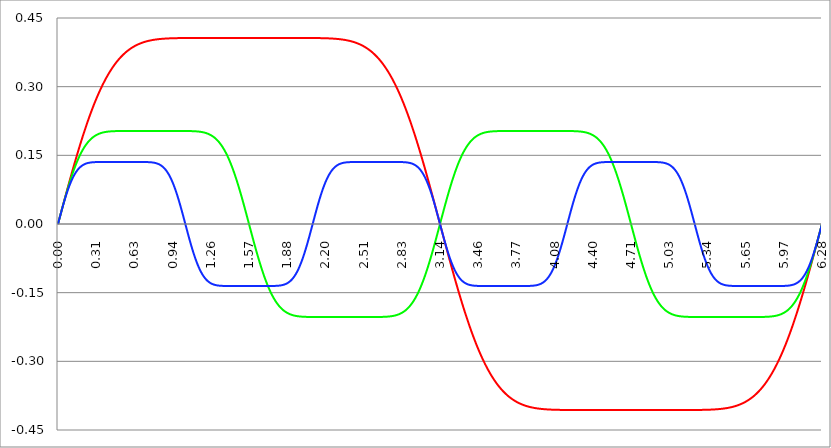
| Category | Series 1 | Series 0 | Series 2 |
|---|---|---|---|
| 0.0 | 0 | 0 | 0 |
| 0.00314159265358979 | 0.003 | 0.003 | 0.003 |
| 0.00628318530717958 | 0.006 | 0.006 | 0.006 |
| 0.00942477796076938 | 0.009 | 0.009 | 0.009 |
| 0.0125663706143592 | 0.013 | 0.013 | 0.013 |
| 0.015707963267949 | 0.016 | 0.016 | 0.016 |
| 0.0188495559215388 | 0.019 | 0.019 | 0.019 |
| 0.0219911485751285 | 0.022 | 0.022 | 0.022 |
| 0.0251327412287183 | 0.025 | 0.025 | 0.025 |
| 0.0282743338823081 | 0.028 | 0.028 | 0.028 |
| 0.0314159265358979 | 0.031 | 0.031 | 0.031 |
| 0.0345575191894877 | 0.034 | 0.034 | 0.034 |
| 0.0376991118430775 | 0.038 | 0.037 | 0.037 |
| 0.0408407044966673 | 0.041 | 0.04 | 0.04 |
| 0.0439822971502571 | 0.044 | 0.043 | 0.043 |
| 0.0471238898038469 | 0.047 | 0.047 | 0.046 |
| 0.0502654824574367 | 0.05 | 0.05 | 0.049 |
| 0.0534070751110265 | 0.053 | 0.053 | 0.051 |
| 0.0565486677646163 | 0.056 | 0.055 | 0.054 |
| 0.059690260418206 | 0.059 | 0.058 | 0.057 |
| 0.0628318530717958 | 0.062 | 0.061 | 0.06 |
| 0.0659734457253856 | 0.066 | 0.064 | 0.062 |
| 0.0691150383789754 | 0.069 | 0.067 | 0.065 |
| 0.0722566310325652 | 0.072 | 0.07 | 0.067 |
| 0.075398223686155 | 0.075 | 0.073 | 0.07 |
| 0.0785398163397448 | 0.078 | 0.076 | 0.072 |
| 0.0816814089933346 | 0.081 | 0.079 | 0.075 |
| 0.0848230016469244 | 0.084 | 0.081 | 0.077 |
| 0.0879645943005142 | 0.087 | 0.084 | 0.08 |
| 0.091106186954104 | 0.09 | 0.087 | 0.082 |
| 0.0942477796076937 | 0.093 | 0.089 | 0.084 |
| 0.0973893722612835 | 0.096 | 0.092 | 0.086 |
| 0.100530964914873 | 0.099 | 0.095 | 0.088 |
| 0.103672557568463 | 0.102 | 0.097 | 0.09 |
| 0.106814150222053 | 0.105 | 0.1 | 0.092 |
| 0.109955742875643 | 0.108 | 0.102 | 0.094 |
| 0.113097335529233 | 0.111 | 0.105 | 0.096 |
| 0.116238928182822 | 0.114 | 0.107 | 0.098 |
| 0.119380520836412 | 0.117 | 0.11 | 0.1 |
| 0.122522113490002 | 0.12 | 0.112 | 0.101 |
| 0.125663706143592 | 0.123 | 0.115 | 0.103 |
| 0.128805298797181 | 0.126 | 0.117 | 0.105 |
| 0.131946891450771 | 0.129 | 0.119 | 0.106 |
| 0.135088484104361 | 0.131 | 0.122 | 0.108 |
| 0.138230076757951 | 0.134 | 0.124 | 0.109 |
| 0.141371669411541 | 0.137 | 0.126 | 0.111 |
| 0.14451326206513 | 0.14 | 0.128 | 0.112 |
| 0.14765485471872 | 0.143 | 0.13 | 0.113 |
| 0.15079644737231 | 0.146 | 0.132 | 0.114 |
| 0.1539380400259 | 0.149 | 0.134 | 0.116 |
| 0.15707963267949 | 0.151 | 0.136 | 0.117 |
| 0.160221225333079 | 0.154 | 0.138 | 0.118 |
| 0.163362817986669 | 0.157 | 0.14 | 0.119 |
| 0.166504410640259 | 0.16 | 0.142 | 0.12 |
| 0.169646003293849 | 0.163 | 0.144 | 0.121 |
| 0.172787595947439 | 0.165 | 0.146 | 0.122 |
| 0.175929188601028 | 0.168 | 0.148 | 0.123 |
| 0.179070781254618 | 0.171 | 0.15 | 0.123 |
| 0.182212373908208 | 0.174 | 0.151 | 0.124 |
| 0.185353966561798 | 0.176 | 0.153 | 0.125 |
| 0.188495559215388 | 0.179 | 0.155 | 0.126 |
| 0.191637151868977 | 0.182 | 0.156 | 0.126 |
| 0.194778744522567 | 0.184 | 0.158 | 0.127 |
| 0.197920337176157 | 0.187 | 0.159 | 0.128 |
| 0.201061929829747 | 0.189 | 0.161 | 0.128 |
| 0.204203522483336 | 0.192 | 0.162 | 0.129 |
| 0.207345115136926 | 0.195 | 0.164 | 0.129 |
| 0.210486707790516 | 0.197 | 0.165 | 0.13 |
| 0.213628300444106 | 0.2 | 0.167 | 0.13 |
| 0.216769893097696 | 0.202 | 0.168 | 0.13 |
| 0.219911485751285 | 0.205 | 0.169 | 0.131 |
| 0.223053078404875 | 0.207 | 0.17 | 0.131 |
| 0.226194671058465 | 0.21 | 0.172 | 0.132 |
| 0.229336263712055 | 0.212 | 0.173 | 0.132 |
| 0.232477856365645 | 0.215 | 0.174 | 0.132 |
| 0.235619449019234 | 0.217 | 0.175 | 0.132 |
| 0.238761041672824 | 0.22 | 0.176 | 0.133 |
| 0.241902634326414 | 0.222 | 0.177 | 0.133 |
| 0.245044226980004 | 0.225 | 0.178 | 0.133 |
| 0.248185819633594 | 0.227 | 0.179 | 0.133 |
| 0.251327412287183 | 0.229 | 0.18 | 0.134 |
| 0.254469004940773 | 0.232 | 0.181 | 0.134 |
| 0.257610597594363 | 0.234 | 0.182 | 0.134 |
| 0.260752190247953 | 0.236 | 0.183 | 0.134 |
| 0.263893782901543 | 0.239 | 0.184 | 0.134 |
| 0.267035375555132 | 0.241 | 0.185 | 0.134 |
| 0.270176968208722 | 0.243 | 0.185 | 0.134 |
| 0.273318560862312 | 0.245 | 0.186 | 0.135 |
| 0.276460153515902 | 0.248 | 0.187 | 0.135 |
| 0.279601746169492 | 0.25 | 0.188 | 0.135 |
| 0.282743338823082 | 0.252 | 0.188 | 0.135 |
| 0.285884931476671 | 0.254 | 0.189 | 0.135 |
| 0.289026524130261 | 0.256 | 0.19 | 0.135 |
| 0.292168116783851 | 0.258 | 0.19 | 0.135 |
| 0.295309709437441 | 0.261 | 0.191 | 0.135 |
| 0.298451302091031 | 0.263 | 0.192 | 0.135 |
| 0.30159289474462 | 0.265 | 0.192 | 0.135 |
| 0.30473448739821 | 0.267 | 0.193 | 0.135 |
| 0.3078760800518 | 0.269 | 0.193 | 0.135 |
| 0.31101767270539 | 0.271 | 0.194 | 0.135 |
| 0.31415926535898 | 0.273 | 0.194 | 0.135 |
| 0.31730085801257 | 0.275 | 0.195 | 0.135 |
| 0.320442450666159 | 0.277 | 0.195 | 0.135 |
| 0.323584043319749 | 0.279 | 0.195 | 0.135 |
| 0.326725635973339 | 0.281 | 0.196 | 0.135 |
| 0.329867228626929 | 0.283 | 0.196 | 0.135 |
| 0.333008821280519 | 0.285 | 0.197 | 0.135 |
| 0.336150413934108 | 0.286 | 0.197 | 0.135 |
| 0.339292006587698 | 0.288 | 0.197 | 0.135 |
| 0.342433599241288 | 0.29 | 0.198 | 0.135 |
| 0.345575191894878 | 0.292 | 0.198 | 0.135 |
| 0.348716784548468 | 0.294 | 0.198 | 0.135 |
| 0.351858377202058 | 0.296 | 0.199 | 0.135 |
| 0.354999969855647 | 0.297 | 0.199 | 0.135 |
| 0.358141562509237 | 0.299 | 0.199 | 0.135 |
| 0.361283155162827 | 0.301 | 0.199 | 0.135 |
| 0.364424747816417 | 0.303 | 0.2 | 0.135 |
| 0.367566340470007 | 0.304 | 0.2 | 0.135 |
| 0.370707933123597 | 0.306 | 0.2 | 0.135 |
| 0.373849525777186 | 0.308 | 0.2 | 0.135 |
| 0.376991118430776 | 0.309 | 0.2 | 0.135 |
| 0.380132711084366 | 0.311 | 0.2 | 0.135 |
| 0.383274303737956 | 0.312 | 0.201 | 0.135 |
| 0.386415896391546 | 0.314 | 0.201 | 0.135 |
| 0.389557489045135 | 0.316 | 0.201 | 0.135 |
| 0.392699081698725 | 0.317 | 0.201 | 0.135 |
| 0.395840674352315 | 0.319 | 0.201 | 0.135 |
| 0.398982267005905 | 0.32 | 0.201 | 0.135 |
| 0.402123859659495 | 0.322 | 0.202 | 0.135 |
| 0.405265452313085 | 0.323 | 0.202 | 0.135 |
| 0.408407044966674 | 0.325 | 0.202 | 0.135 |
| 0.411548637620264 | 0.326 | 0.202 | 0.135 |
| 0.414690230273854 | 0.327 | 0.202 | 0.135 |
| 0.417831822927444 | 0.329 | 0.202 | 0.135 |
| 0.420973415581034 | 0.33 | 0.202 | 0.135 |
| 0.424115008234623 | 0.332 | 0.202 | 0.135 |
| 0.427256600888213 | 0.333 | 0.202 | 0.135 |
| 0.430398193541803 | 0.334 | 0.202 | 0.135 |
| 0.433539786195393 | 0.336 | 0.202 | 0.135 |
| 0.436681378848983 | 0.337 | 0.202 | 0.135 |
| 0.439822971502573 | 0.338 | 0.202 | 0.135 |
| 0.442964564156162 | 0.34 | 0.203 | 0.135 |
| 0.446106156809752 | 0.341 | 0.203 | 0.135 |
| 0.449247749463342 | 0.342 | 0.203 | 0.135 |
| 0.452389342116932 | 0.343 | 0.203 | 0.135 |
| 0.455530934770522 | 0.344 | 0.203 | 0.135 |
| 0.458672527424111 | 0.346 | 0.203 | 0.135 |
| 0.461814120077701 | 0.347 | 0.203 | 0.135 |
| 0.464955712731291 | 0.348 | 0.203 | 0.135 |
| 0.468097305384881 | 0.349 | 0.203 | 0.135 |
| 0.471238898038471 | 0.35 | 0.203 | 0.135 |
| 0.474380490692061 | 0.351 | 0.203 | 0.135 |
| 0.47752208334565 | 0.352 | 0.203 | 0.135 |
| 0.48066367599924 | 0.353 | 0.203 | 0.135 |
| 0.48380526865283 | 0.355 | 0.203 | 0.135 |
| 0.48694686130642 | 0.356 | 0.203 | 0.135 |
| 0.49008845396001 | 0.357 | 0.203 | 0.135 |
| 0.493230046613599 | 0.358 | 0.203 | 0.135 |
| 0.496371639267189 | 0.359 | 0.203 | 0.135 |
| 0.499513231920779 | 0.36 | 0.203 | 0.135 |
| 0.502654824574369 | 0.361 | 0.203 | 0.135 |
| 0.505796417227959 | 0.361 | 0.203 | 0.135 |
| 0.508938009881549 | 0.362 | 0.203 | 0.135 |
| 0.512079602535138 | 0.363 | 0.203 | 0.135 |
| 0.515221195188728 | 0.364 | 0.203 | 0.135 |
| 0.518362787842318 | 0.365 | 0.203 | 0.135 |
| 0.521504380495908 | 0.366 | 0.203 | 0.135 |
| 0.524645973149498 | 0.367 | 0.203 | 0.135 |
| 0.527787565803087 | 0.368 | 0.203 | 0.135 |
| 0.530929158456677 | 0.369 | 0.203 | 0.135 |
| 0.534070751110267 | 0.369 | 0.203 | 0.135 |
| 0.537212343763857 | 0.37 | 0.203 | 0.135 |
| 0.540353936417447 | 0.371 | 0.203 | 0.135 |
| 0.543495529071037 | 0.372 | 0.203 | 0.135 |
| 0.546637121724626 | 0.373 | 0.203 | 0.135 |
| 0.549778714378216 | 0.373 | 0.203 | 0.135 |
| 0.552920307031806 | 0.374 | 0.203 | 0.135 |
| 0.556061899685396 | 0.375 | 0.203 | 0.135 |
| 0.559203492338986 | 0.375 | 0.203 | 0.135 |
| 0.562345084992576 | 0.376 | 0.203 | 0.135 |
| 0.565486677646165 | 0.377 | 0.203 | 0.135 |
| 0.568628270299755 | 0.378 | 0.203 | 0.135 |
| 0.571769862953345 | 0.378 | 0.203 | 0.135 |
| 0.574911455606935 | 0.379 | 0.203 | 0.135 |
| 0.578053048260525 | 0.38 | 0.203 | 0.135 |
| 0.581194640914114 | 0.38 | 0.203 | 0.135 |
| 0.584336233567704 | 0.381 | 0.203 | 0.135 |
| 0.587477826221294 | 0.381 | 0.203 | 0.135 |
| 0.590619418874884 | 0.382 | 0.203 | 0.135 |
| 0.593761011528474 | 0.383 | 0.203 | 0.135 |
| 0.596902604182064 | 0.383 | 0.203 | 0.135 |
| 0.600044196835653 | 0.384 | 0.203 | 0.135 |
| 0.603185789489243 | 0.384 | 0.203 | 0.135 |
| 0.606327382142833 | 0.385 | 0.203 | 0.135 |
| 0.609468974796423 | 0.385 | 0.203 | 0.135 |
| 0.612610567450013 | 0.386 | 0.203 | 0.135 |
| 0.615752160103602 | 0.386 | 0.203 | 0.135 |
| 0.618893752757192 | 0.387 | 0.203 | 0.135 |
| 0.622035345410782 | 0.387 | 0.203 | 0.135 |
| 0.625176938064372 | 0.388 | 0.203 | 0.135 |
| 0.628318530717962 | 0.388 | 0.203 | 0.135 |
| 0.631460123371551 | 0.389 | 0.203 | 0.135 |
| 0.634601716025141 | 0.389 | 0.203 | 0.135 |
| 0.637743308678731 | 0.39 | 0.203 | 0.135 |
| 0.640884901332321 | 0.39 | 0.203 | 0.135 |
| 0.644026493985911 | 0.391 | 0.203 | 0.135 |
| 0.647168086639501 | 0.391 | 0.203 | 0.135 |
| 0.65030967929309 | 0.391 | 0.203 | 0.135 |
| 0.65345127194668 | 0.392 | 0.203 | 0.135 |
| 0.65659286460027 | 0.392 | 0.203 | 0.135 |
| 0.65973445725386 | 0.392 | 0.203 | 0.135 |
| 0.66287604990745 | 0.393 | 0.203 | 0.135 |
| 0.666017642561039 | 0.393 | 0.203 | 0.135 |
| 0.669159235214629 | 0.394 | 0.203 | 0.135 |
| 0.672300827868219 | 0.394 | 0.203 | 0.135 |
| 0.675442420521809 | 0.394 | 0.203 | 0.135 |
| 0.678584013175399 | 0.395 | 0.203 | 0.135 |
| 0.681725605828989 | 0.395 | 0.203 | 0.135 |
| 0.684867198482578 | 0.395 | 0.203 | 0.135 |
| 0.688008791136168 | 0.396 | 0.203 | 0.135 |
| 0.691150383789758 | 0.396 | 0.203 | 0.135 |
| 0.694291976443348 | 0.396 | 0.203 | 0.135 |
| 0.697433569096938 | 0.396 | 0.203 | 0.135 |
| 0.700575161750528 | 0.397 | 0.203 | 0.135 |
| 0.703716754404117 | 0.397 | 0.203 | 0.135 |
| 0.706858347057707 | 0.397 | 0.203 | 0.135 |
| 0.709999939711297 | 0.398 | 0.203 | 0.135 |
| 0.713141532364887 | 0.398 | 0.203 | 0.135 |
| 0.716283125018477 | 0.398 | 0.203 | 0.135 |
| 0.719424717672066 | 0.398 | 0.203 | 0.135 |
| 0.722566310325656 | 0.399 | 0.203 | 0.135 |
| 0.725707902979246 | 0.399 | 0.203 | 0.135 |
| 0.728849495632836 | 0.399 | 0.203 | 0.135 |
| 0.731991088286426 | 0.399 | 0.203 | 0.135 |
| 0.735132680940016 | 0.399 | 0.203 | 0.135 |
| 0.738274273593605 | 0.4 | 0.203 | 0.135 |
| 0.741415866247195 | 0.4 | 0.203 | 0.135 |
| 0.744557458900785 | 0.4 | 0.203 | 0.135 |
| 0.747699051554375 | 0.4 | 0.203 | 0.135 |
| 0.750840644207965 | 0.4 | 0.203 | 0.135 |
| 0.753982236861554 | 0.401 | 0.203 | 0.135 |
| 0.757123829515144 | 0.401 | 0.203 | 0.135 |
| 0.760265422168734 | 0.401 | 0.203 | 0.135 |
| 0.763407014822324 | 0.401 | 0.203 | 0.135 |
| 0.766548607475914 | 0.401 | 0.203 | 0.135 |
| 0.769690200129504 | 0.401 | 0.203 | 0.135 |
| 0.772831792783093 | 0.402 | 0.203 | 0.135 |
| 0.775973385436683 | 0.402 | 0.203 | 0.134 |
| 0.779114978090273 | 0.402 | 0.203 | 0.134 |
| 0.782256570743863 | 0.402 | 0.203 | 0.134 |
| 0.785398163397453 | 0.402 | 0.203 | 0.134 |
| 0.788539756051042 | 0.402 | 0.203 | 0.134 |
| 0.791681348704632 | 0.403 | 0.203 | 0.134 |
| 0.794822941358222 | 0.403 | 0.203 | 0.134 |
| 0.797964534011812 | 0.403 | 0.203 | 0.133 |
| 0.801106126665402 | 0.403 | 0.203 | 0.133 |
| 0.804247719318992 | 0.403 | 0.203 | 0.133 |
| 0.807389311972581 | 0.403 | 0.203 | 0.133 |
| 0.810530904626171 | 0.403 | 0.203 | 0.133 |
| 0.813672497279761 | 0.403 | 0.203 | 0.132 |
| 0.816814089933351 | 0.403 | 0.203 | 0.132 |
| 0.819955682586941 | 0.404 | 0.203 | 0.132 |
| 0.823097275240531 | 0.404 | 0.203 | 0.131 |
| 0.82623886789412 | 0.404 | 0.203 | 0.131 |
| 0.82938046054771 | 0.404 | 0.203 | 0.131 |
| 0.8325220532013 | 0.404 | 0.203 | 0.13 |
| 0.83566364585489 | 0.404 | 0.203 | 0.13 |
| 0.83880523850848 | 0.404 | 0.203 | 0.129 |
| 0.841946831162069 | 0.404 | 0.203 | 0.129 |
| 0.845088423815659 | 0.404 | 0.203 | 0.128 |
| 0.848230016469249 | 0.404 | 0.203 | 0.128 |
| 0.851371609122839 | 0.404 | 0.203 | 0.127 |
| 0.854513201776429 | 0.404 | 0.203 | 0.127 |
| 0.857654794430019 | 0.405 | 0.203 | 0.126 |
| 0.860796387083608 | 0.405 | 0.203 | 0.125 |
| 0.863937979737198 | 0.405 | 0.203 | 0.124 |
| 0.867079572390788 | 0.405 | 0.203 | 0.124 |
| 0.870221165044378 | 0.405 | 0.203 | 0.123 |
| 0.873362757697968 | 0.405 | 0.203 | 0.122 |
| 0.876504350351557 | 0.405 | 0.203 | 0.121 |
| 0.879645943005147 | 0.405 | 0.203 | 0.12 |
| 0.882787535658737 | 0.405 | 0.203 | 0.119 |
| 0.885929128312327 | 0.405 | 0.203 | 0.118 |
| 0.889070720965917 | 0.405 | 0.203 | 0.117 |
| 0.892212313619507 | 0.405 | 0.203 | 0.116 |
| 0.895353906273096 | 0.405 | 0.203 | 0.115 |
| 0.898495498926686 | 0.405 | 0.203 | 0.114 |
| 0.901637091580276 | 0.405 | 0.203 | 0.112 |
| 0.904778684233866 | 0.405 | 0.203 | 0.111 |
| 0.907920276887456 | 0.405 | 0.203 | 0.11 |
| 0.911061869541045 | 0.405 | 0.203 | 0.108 |
| 0.914203462194635 | 0.405 | 0.203 | 0.107 |
| 0.917345054848225 | 0.406 | 0.203 | 0.105 |
| 0.920486647501815 | 0.406 | 0.203 | 0.104 |
| 0.923628240155405 | 0.406 | 0.203 | 0.102 |
| 0.926769832808995 | 0.406 | 0.203 | 0.1 |
| 0.929911425462584 | 0.406 | 0.203 | 0.099 |
| 0.933053018116174 | 0.406 | 0.203 | 0.097 |
| 0.936194610769764 | 0.406 | 0.203 | 0.095 |
| 0.939336203423354 | 0.406 | 0.203 | 0.093 |
| 0.942477796076944 | 0.406 | 0.203 | 0.091 |
| 0.945619388730533 | 0.406 | 0.203 | 0.089 |
| 0.948760981384123 | 0.406 | 0.203 | 0.087 |
| 0.951902574037713 | 0.406 | 0.203 | 0.085 |
| 0.955044166691303 | 0.406 | 0.203 | 0.083 |
| 0.958185759344893 | 0.406 | 0.203 | 0.08 |
| 0.961327351998483 | 0.406 | 0.203 | 0.078 |
| 0.964468944652072 | 0.406 | 0.203 | 0.076 |
| 0.967610537305662 | 0.406 | 0.203 | 0.073 |
| 0.970752129959252 | 0.406 | 0.203 | 0.071 |
| 0.973893722612842 | 0.406 | 0.203 | 0.068 |
| 0.977035315266432 | 0.406 | 0.203 | 0.066 |
| 0.980176907920022 | 0.406 | 0.203 | 0.063 |
| 0.983318500573611 | 0.406 | 0.203 | 0.061 |
| 0.986460093227201 | 0.406 | 0.203 | 0.058 |
| 0.989601685880791 | 0.406 | 0.203 | 0.055 |
| 0.992743278534381 | 0.406 | 0.203 | 0.052 |
| 0.995884871187971 | 0.406 | 0.203 | 0.05 |
| 0.99902646384156 | 0.406 | 0.203 | 0.047 |
| 1.00216805649515 | 0.406 | 0.203 | 0.044 |
| 1.00530964914874 | 0.406 | 0.203 | 0.041 |
| 1.00845124180233 | 0.406 | 0.203 | 0.038 |
| 1.01159283445592 | 0.406 | 0.203 | 0.035 |
| 1.01473442710951 | 0.406 | 0.203 | 0.032 |
| 1.017876019763099 | 0.406 | 0.203 | 0.029 |
| 1.021017612416689 | 0.406 | 0.203 | 0.026 |
| 1.02415920507028 | 0.406 | 0.203 | 0.023 |
| 1.027300797723869 | 0.406 | 0.203 | 0.02 |
| 1.030442390377459 | 0.406 | 0.203 | 0.017 |
| 1.033583983031048 | 0.406 | 0.203 | 0.014 |
| 1.036725575684638 | 0.406 | 0.203 | 0.01 |
| 1.039867168338228 | 0.406 | 0.203 | 0.007 |
| 1.043008760991818 | 0.406 | 0.203 | 0.004 |
| 1.046150353645408 | 0.406 | 0.203 | 0.001 |
| 1.049291946298998 | 0.406 | 0.203 | -0.002 |
| 1.052433538952587 | 0.406 | 0.203 | -0.005 |
| 1.055575131606177 | 0.406 | 0.203 | -0.008 |
| 1.058716724259767 | 0.406 | 0.203 | -0.011 |
| 1.061858316913357 | 0.406 | 0.203 | -0.015 |
| 1.064999909566947 | 0.406 | 0.203 | -0.018 |
| 1.068141502220536 | 0.406 | 0.203 | -0.021 |
| 1.071283094874126 | 0.406 | 0.203 | -0.024 |
| 1.074424687527716 | 0.406 | 0.203 | -0.027 |
| 1.077566280181306 | 0.406 | 0.203 | -0.03 |
| 1.080707872834896 | 0.406 | 0.203 | -0.033 |
| 1.083849465488486 | 0.406 | 0.203 | -0.036 |
| 1.086991058142075 | 0.406 | 0.203 | -0.039 |
| 1.090132650795665 | 0.406 | 0.203 | -0.042 |
| 1.093274243449255 | 0.406 | 0.203 | -0.045 |
| 1.096415836102845 | 0.406 | 0.203 | -0.048 |
| 1.099557428756435 | 0.406 | 0.203 | -0.05 |
| 1.102699021410025 | 0.406 | 0.203 | -0.053 |
| 1.105840614063614 | 0.406 | 0.203 | -0.056 |
| 1.108982206717204 | 0.406 | 0.203 | -0.059 |
| 1.112123799370794 | 0.406 | 0.203 | -0.061 |
| 1.115265392024384 | 0.406 | 0.203 | -0.064 |
| 1.118406984677974 | 0.406 | 0.203 | -0.067 |
| 1.121548577331563 | 0.406 | 0.203 | -0.069 |
| 1.124690169985153 | 0.406 | 0.203 | -0.072 |
| 1.127831762638743 | 0.406 | 0.203 | -0.074 |
| 1.130973355292333 | 0.406 | 0.202 | -0.076 |
| 1.134114947945923 | 0.406 | 0.202 | -0.079 |
| 1.137256540599513 | 0.406 | 0.202 | -0.081 |
| 1.140398133253102 | 0.406 | 0.202 | -0.083 |
| 1.143539725906692 | 0.406 | 0.202 | -0.085 |
| 1.146681318560282 | 0.406 | 0.202 | -0.088 |
| 1.149822911213872 | 0.406 | 0.202 | -0.09 |
| 1.152964503867462 | 0.406 | 0.202 | -0.092 |
| 1.156106096521051 | 0.406 | 0.202 | -0.094 |
| 1.159247689174641 | 0.406 | 0.202 | -0.095 |
| 1.162389281828231 | 0.406 | 0.202 | -0.097 |
| 1.165530874481821 | 0.406 | 0.202 | -0.099 |
| 1.168672467135411 | 0.406 | 0.202 | -0.101 |
| 1.171814059789001 | 0.406 | 0.201 | -0.103 |
| 1.17495565244259 | 0.406 | 0.201 | -0.104 |
| 1.17809724509618 | 0.406 | 0.201 | -0.106 |
| 1.18123883774977 | 0.406 | 0.201 | -0.107 |
| 1.18438043040336 | 0.406 | 0.201 | -0.109 |
| 1.18752202305695 | 0.406 | 0.201 | -0.11 |
| 1.190663615710539 | 0.406 | 0.2 | -0.111 |
| 1.193805208364129 | 0.406 | 0.2 | -0.113 |
| 1.19694680101772 | 0.406 | 0.2 | -0.114 |
| 1.200088393671309 | 0.406 | 0.2 | -0.115 |
| 1.203229986324899 | 0.406 | 0.2 | -0.116 |
| 1.206371578978489 | 0.406 | 0.2 | -0.117 |
| 1.209513171632078 | 0.406 | 0.199 | -0.119 |
| 1.212654764285668 | 0.406 | 0.199 | -0.12 |
| 1.215796356939258 | 0.406 | 0.199 | -0.12 |
| 1.218937949592848 | 0.406 | 0.199 | -0.121 |
| 1.222079542246438 | 0.406 | 0.198 | -0.122 |
| 1.225221134900027 | 0.406 | 0.198 | -0.123 |
| 1.228362727553617 | 0.406 | 0.198 | -0.124 |
| 1.231504320207207 | 0.406 | 0.197 | -0.125 |
| 1.234645912860797 | 0.406 | 0.197 | -0.125 |
| 1.237787505514387 | 0.406 | 0.197 | -0.126 |
| 1.240929098167977 | 0.406 | 0.196 | -0.127 |
| 1.244070690821566 | 0.406 | 0.196 | -0.127 |
| 1.247212283475156 | 0.406 | 0.195 | -0.128 |
| 1.250353876128746 | 0.406 | 0.195 | -0.128 |
| 1.253495468782336 | 0.406 | 0.195 | -0.129 |
| 1.256637061435926 | 0.406 | 0.194 | -0.129 |
| 1.259778654089515 | 0.406 | 0.194 | -0.13 |
| 1.262920246743105 | 0.406 | 0.193 | -0.13 |
| 1.266061839396695 | 0.406 | 0.193 | -0.131 |
| 1.269203432050285 | 0.406 | 0.192 | -0.131 |
| 1.272345024703875 | 0.406 | 0.192 | -0.131 |
| 1.275486617357465 | 0.406 | 0.191 | -0.132 |
| 1.278628210011054 | 0.406 | 0.19 | -0.132 |
| 1.281769802664644 | 0.406 | 0.19 | -0.132 |
| 1.284911395318234 | 0.406 | 0.189 | -0.133 |
| 1.288052987971824 | 0.406 | 0.188 | -0.133 |
| 1.291194580625414 | 0.406 | 0.188 | -0.133 |
| 1.294336173279003 | 0.406 | 0.187 | -0.133 |
| 1.297477765932593 | 0.406 | 0.186 | -0.133 |
| 1.300619358586183 | 0.406 | 0.185 | -0.134 |
| 1.303760951239773 | 0.406 | 0.185 | -0.134 |
| 1.306902543893363 | 0.406 | 0.184 | -0.134 |
| 1.310044136546953 | 0.406 | 0.183 | -0.134 |
| 1.313185729200542 | 0.406 | 0.182 | -0.134 |
| 1.316327321854132 | 0.406 | 0.181 | -0.134 |
| 1.319468914507722 | 0.406 | 0.18 | -0.134 |
| 1.322610507161312 | 0.406 | 0.179 | -0.135 |
| 1.325752099814902 | 0.406 | 0.178 | -0.135 |
| 1.328893692468491 | 0.406 | 0.177 | -0.135 |
| 1.332035285122081 | 0.406 | 0.176 | -0.135 |
| 1.335176877775671 | 0.406 | 0.175 | -0.135 |
| 1.338318470429261 | 0.406 | 0.174 | -0.135 |
| 1.341460063082851 | 0.406 | 0.173 | -0.135 |
| 1.344601655736441 | 0.406 | 0.172 | -0.135 |
| 1.34774324839003 | 0.406 | 0.17 | -0.135 |
| 1.35088484104362 | 0.406 | 0.169 | -0.135 |
| 1.35402643369721 | 0.406 | 0.168 | -0.135 |
| 1.3571680263508 | 0.406 | 0.167 | -0.135 |
| 1.36030961900439 | 0.406 | 0.165 | -0.135 |
| 1.363451211657979 | 0.406 | 0.164 | -0.135 |
| 1.36659280431157 | 0.406 | 0.162 | -0.135 |
| 1.369734396965159 | 0.406 | 0.161 | -0.135 |
| 1.372875989618749 | 0.406 | 0.159 | -0.135 |
| 1.376017582272339 | 0.406 | 0.158 | -0.135 |
| 1.379159174925929 | 0.406 | 0.156 | -0.135 |
| 1.382300767579518 | 0.406 | 0.155 | -0.135 |
| 1.385442360233108 | 0.406 | 0.153 | -0.135 |
| 1.388583952886698 | 0.406 | 0.151 | -0.135 |
| 1.391725545540288 | 0.406 | 0.15 | -0.135 |
| 1.394867138193878 | 0.406 | 0.148 | -0.135 |
| 1.398008730847468 | 0.406 | 0.146 | -0.135 |
| 1.401150323501057 | 0.406 | 0.144 | -0.135 |
| 1.404291916154647 | 0.406 | 0.142 | -0.135 |
| 1.407433508808237 | 0.406 | 0.14 | -0.135 |
| 1.410575101461827 | 0.406 | 0.138 | -0.135 |
| 1.413716694115417 | 0.406 | 0.136 | -0.135 |
| 1.416858286769006 | 0.406 | 0.134 | -0.135 |
| 1.419999879422596 | 0.406 | 0.132 | -0.135 |
| 1.423141472076186 | 0.406 | 0.13 | -0.135 |
| 1.426283064729776 | 0.406 | 0.128 | -0.135 |
| 1.429424657383366 | 0.406 | 0.126 | -0.135 |
| 1.432566250036956 | 0.406 | 0.124 | -0.135 |
| 1.435707842690545 | 0.406 | 0.122 | -0.135 |
| 1.438849435344135 | 0.406 | 0.119 | -0.135 |
| 1.441991027997725 | 0.406 | 0.117 | -0.135 |
| 1.445132620651315 | 0.406 | 0.115 | -0.135 |
| 1.448274213304905 | 0.406 | 0.112 | -0.135 |
| 1.451415805958494 | 0.406 | 0.11 | -0.135 |
| 1.454557398612084 | 0.406 | 0.107 | -0.135 |
| 1.457698991265674 | 0.406 | 0.105 | -0.135 |
| 1.460840583919264 | 0.406 | 0.102 | -0.135 |
| 1.463982176572854 | 0.406 | 0.1 | -0.135 |
| 1.467123769226444 | 0.406 | 0.097 | -0.135 |
| 1.470265361880033 | 0.406 | 0.095 | -0.135 |
| 1.473406954533623 | 0.406 | 0.092 | -0.135 |
| 1.476548547187213 | 0.406 | 0.089 | -0.135 |
| 1.479690139840803 | 0.406 | 0.087 | -0.135 |
| 1.482831732494393 | 0.406 | 0.084 | -0.135 |
| 1.485973325147982 | 0.406 | 0.081 | -0.135 |
| 1.489114917801572 | 0.406 | 0.079 | -0.135 |
| 1.492256510455162 | 0.406 | 0.076 | -0.135 |
| 1.495398103108752 | 0.406 | 0.073 | -0.135 |
| 1.498539695762342 | 0.406 | 0.07 | -0.135 |
| 1.501681288415932 | 0.406 | 0.067 | -0.135 |
| 1.504822881069521 | 0.406 | 0.064 | -0.135 |
| 1.507964473723111 | 0.406 | 0.061 | -0.135 |
| 1.511106066376701 | 0.406 | 0.058 | -0.135 |
| 1.514247659030291 | 0.406 | 0.055 | -0.135 |
| 1.517389251683881 | 0.406 | 0.053 | -0.135 |
| 1.520530844337471 | 0.406 | 0.05 | -0.135 |
| 1.52367243699106 | 0.406 | 0.047 | -0.135 |
| 1.52681402964465 | 0.406 | 0.043 | -0.135 |
| 1.52995562229824 | 0.406 | 0.04 | -0.135 |
| 1.53309721495183 | 0.406 | 0.037 | -0.135 |
| 1.53623880760542 | 0.406 | 0.034 | -0.135 |
| 1.539380400259009 | 0.406 | 0.031 | -0.135 |
| 1.542521992912599 | 0.406 | 0.028 | -0.135 |
| 1.545663585566189 | 0.406 | 0.025 | -0.135 |
| 1.548805178219779 | 0.406 | 0.022 | -0.135 |
| 1.551946770873369 | 0.406 | 0.019 | -0.135 |
| 1.555088363526959 | 0.406 | 0.016 | -0.135 |
| 1.558229956180548 | 0.406 | 0.013 | -0.135 |
| 1.561371548834138 | 0.406 | 0.009 | -0.135 |
| 1.564513141487728 | 0.406 | 0.006 | -0.135 |
| 1.567654734141318 | 0.406 | 0.003 | -0.135 |
| 1.570796326794908 | 0.406 | 0 | -0.135 |
| 1.573937919448497 | 0.406 | -0.003 | -0.135 |
| 1.577079512102087 | 0.406 | -0.006 | -0.135 |
| 1.580221104755677 | 0.406 | -0.009 | -0.135 |
| 1.583362697409267 | 0.406 | -0.013 | -0.135 |
| 1.586504290062857 | 0.406 | -0.016 | -0.135 |
| 1.589645882716447 | 0.406 | -0.019 | -0.135 |
| 1.592787475370036 | 0.406 | -0.022 | -0.135 |
| 1.595929068023626 | 0.406 | -0.025 | -0.135 |
| 1.599070660677216 | 0.406 | -0.028 | -0.135 |
| 1.602212253330806 | 0.406 | -0.031 | -0.135 |
| 1.605353845984396 | 0.406 | -0.034 | -0.135 |
| 1.608495438637985 | 0.406 | -0.037 | -0.135 |
| 1.611637031291575 | 0.406 | -0.04 | -0.135 |
| 1.614778623945165 | 0.406 | -0.043 | -0.135 |
| 1.617920216598755 | 0.406 | -0.047 | -0.135 |
| 1.621061809252345 | 0.406 | -0.05 | -0.135 |
| 1.624203401905935 | 0.406 | -0.053 | -0.135 |
| 1.627344994559524 | 0.406 | -0.055 | -0.135 |
| 1.630486587213114 | 0.406 | -0.058 | -0.135 |
| 1.633628179866704 | 0.406 | -0.061 | -0.135 |
| 1.636769772520294 | 0.406 | -0.064 | -0.135 |
| 1.639911365173884 | 0.406 | -0.067 | -0.135 |
| 1.643052957827473 | 0.406 | -0.07 | -0.135 |
| 1.646194550481063 | 0.406 | -0.073 | -0.135 |
| 1.649336143134653 | 0.406 | -0.076 | -0.135 |
| 1.652477735788243 | 0.406 | -0.079 | -0.135 |
| 1.655619328441833 | 0.406 | -0.081 | -0.135 |
| 1.658760921095423 | 0.406 | -0.084 | -0.135 |
| 1.661902513749012 | 0.406 | -0.087 | -0.135 |
| 1.665044106402602 | 0.406 | -0.089 | -0.135 |
| 1.668185699056192 | 0.406 | -0.092 | -0.135 |
| 1.671327291709782 | 0.406 | -0.095 | -0.135 |
| 1.674468884363372 | 0.406 | -0.097 | -0.135 |
| 1.677610477016961 | 0.406 | -0.1 | -0.135 |
| 1.680752069670551 | 0.406 | -0.102 | -0.135 |
| 1.683893662324141 | 0.406 | -0.105 | -0.135 |
| 1.687035254977731 | 0.406 | -0.107 | -0.135 |
| 1.690176847631321 | 0.406 | -0.11 | -0.135 |
| 1.693318440284911 | 0.406 | -0.112 | -0.135 |
| 1.6964600329385 | 0.406 | -0.115 | -0.135 |
| 1.69960162559209 | 0.406 | -0.117 | -0.135 |
| 1.70274321824568 | 0.406 | -0.119 | -0.135 |
| 1.70588481089927 | 0.406 | -0.122 | -0.135 |
| 1.70902640355286 | 0.406 | -0.124 | -0.135 |
| 1.712167996206449 | 0.406 | -0.126 | -0.135 |
| 1.715309588860039 | 0.406 | -0.128 | -0.135 |
| 1.71845118151363 | 0.406 | -0.13 | -0.135 |
| 1.721592774167219 | 0.406 | -0.132 | -0.135 |
| 1.724734366820809 | 0.406 | -0.134 | -0.135 |
| 1.727875959474399 | 0.406 | -0.136 | -0.135 |
| 1.731017552127988 | 0.406 | -0.138 | -0.135 |
| 1.734159144781578 | 0.406 | -0.14 | -0.135 |
| 1.737300737435168 | 0.406 | -0.142 | -0.135 |
| 1.740442330088758 | 0.406 | -0.144 | -0.135 |
| 1.743583922742348 | 0.406 | -0.146 | -0.135 |
| 1.746725515395937 | 0.406 | -0.148 | -0.135 |
| 1.749867108049527 | 0.406 | -0.15 | -0.135 |
| 1.753008700703117 | 0.406 | -0.151 | -0.135 |
| 1.756150293356707 | 0.406 | -0.153 | -0.135 |
| 1.759291886010297 | 0.406 | -0.155 | -0.135 |
| 1.762433478663887 | 0.406 | -0.156 | -0.135 |
| 1.765575071317476 | 0.406 | -0.158 | -0.135 |
| 1.768716663971066 | 0.406 | -0.159 | -0.135 |
| 1.771858256624656 | 0.406 | -0.161 | -0.135 |
| 1.774999849278246 | 0.406 | -0.162 | -0.135 |
| 1.778141441931836 | 0.406 | -0.164 | -0.135 |
| 1.781283034585426 | 0.406 | -0.165 | -0.135 |
| 1.784424627239015 | 0.406 | -0.167 | -0.135 |
| 1.787566219892605 | 0.406 | -0.168 | -0.135 |
| 1.790707812546195 | 0.406 | -0.169 | -0.135 |
| 1.793849405199785 | 0.406 | -0.17 | -0.135 |
| 1.796990997853375 | 0.406 | -0.172 | -0.135 |
| 1.800132590506964 | 0.406 | -0.173 | -0.135 |
| 1.803274183160554 | 0.406 | -0.174 | -0.135 |
| 1.806415775814144 | 0.406 | -0.175 | -0.135 |
| 1.809557368467734 | 0.406 | -0.176 | -0.135 |
| 1.812698961121324 | 0.406 | -0.177 | -0.135 |
| 1.815840553774914 | 0.406 | -0.178 | -0.135 |
| 1.818982146428503 | 0.406 | -0.179 | -0.135 |
| 1.822123739082093 | 0.406 | -0.18 | -0.134 |
| 1.825265331735683 | 0.406 | -0.181 | -0.134 |
| 1.828406924389273 | 0.406 | -0.182 | -0.134 |
| 1.831548517042863 | 0.406 | -0.183 | -0.134 |
| 1.834690109696452 | 0.406 | -0.184 | -0.134 |
| 1.837831702350042 | 0.406 | -0.185 | -0.134 |
| 1.840973295003632 | 0.406 | -0.185 | -0.134 |
| 1.844114887657222 | 0.406 | -0.186 | -0.133 |
| 1.847256480310812 | 0.406 | -0.187 | -0.133 |
| 1.850398072964402 | 0.406 | -0.188 | -0.133 |
| 1.853539665617991 | 0.406 | -0.188 | -0.133 |
| 1.856681258271581 | 0.406 | -0.189 | -0.133 |
| 1.859822850925171 | 0.406 | -0.19 | -0.132 |
| 1.862964443578761 | 0.406 | -0.19 | -0.132 |
| 1.866106036232351 | 0.406 | -0.191 | -0.132 |
| 1.86924762888594 | 0.406 | -0.192 | -0.131 |
| 1.87238922153953 | 0.406 | -0.192 | -0.131 |
| 1.87553081419312 | 0.406 | -0.193 | -0.131 |
| 1.87867240684671 | 0.406 | -0.193 | -0.13 |
| 1.8818139995003 | 0.406 | -0.194 | -0.13 |
| 1.88495559215389 | 0.406 | -0.194 | -0.129 |
| 1.888097184807479 | 0.406 | -0.195 | -0.129 |
| 1.891238777461069 | 0.406 | -0.195 | -0.128 |
| 1.89438037011466 | 0.406 | -0.195 | -0.128 |
| 1.897521962768249 | 0.406 | -0.196 | -0.127 |
| 1.900663555421839 | 0.406 | -0.196 | -0.127 |
| 1.903805148075429 | 0.406 | -0.197 | -0.126 |
| 1.906946740729018 | 0.406 | -0.197 | -0.125 |
| 1.910088333382608 | 0.406 | -0.197 | -0.125 |
| 1.913229926036198 | 0.406 | -0.198 | -0.124 |
| 1.916371518689788 | 0.406 | -0.198 | -0.123 |
| 1.919513111343378 | 0.406 | -0.198 | -0.122 |
| 1.922654703996967 | 0.406 | -0.199 | -0.121 |
| 1.925796296650557 | 0.406 | -0.199 | -0.12 |
| 1.928937889304147 | 0.406 | -0.199 | -0.12 |
| 1.932079481957737 | 0.406 | -0.199 | -0.119 |
| 1.935221074611327 | 0.406 | -0.2 | -0.117 |
| 1.938362667264917 | 0.406 | -0.2 | -0.116 |
| 1.941504259918506 | 0.406 | -0.2 | -0.115 |
| 1.944645852572096 | 0.406 | -0.2 | -0.114 |
| 1.947787445225686 | 0.406 | -0.2 | -0.113 |
| 1.950929037879276 | 0.406 | -0.2 | -0.111 |
| 1.954070630532866 | 0.406 | -0.201 | -0.11 |
| 1.957212223186455 | 0.406 | -0.201 | -0.109 |
| 1.960353815840045 | 0.406 | -0.201 | -0.107 |
| 1.963495408493635 | 0.406 | -0.201 | -0.106 |
| 1.966637001147225 | 0.406 | -0.201 | -0.104 |
| 1.969778593800815 | 0.406 | -0.201 | -0.103 |
| 1.972920186454405 | 0.406 | -0.202 | -0.101 |
| 1.976061779107994 | 0.406 | -0.202 | -0.099 |
| 1.979203371761584 | 0.406 | -0.202 | -0.097 |
| 1.982344964415174 | 0.406 | -0.202 | -0.095 |
| 1.985486557068764 | 0.406 | -0.202 | -0.094 |
| 1.988628149722354 | 0.406 | -0.202 | -0.092 |
| 1.991769742375943 | 0.406 | -0.202 | -0.09 |
| 1.994911335029533 | 0.406 | -0.202 | -0.088 |
| 1.998052927683123 | 0.406 | -0.202 | -0.085 |
| 2.001194520336712 | 0.406 | -0.202 | -0.083 |
| 2.004336112990302 | 0.406 | -0.202 | -0.081 |
| 2.007477705643892 | 0.406 | -0.202 | -0.079 |
| 2.010619298297482 | 0.406 | -0.202 | -0.076 |
| 2.013760890951071 | 0.406 | -0.203 | -0.074 |
| 2.016902483604661 | 0.406 | -0.203 | -0.072 |
| 2.02004407625825 | 0.406 | -0.203 | -0.069 |
| 2.02318566891184 | 0.406 | -0.203 | -0.067 |
| 2.02632726156543 | 0.406 | -0.203 | -0.064 |
| 2.029468854219019 | 0.406 | -0.203 | -0.061 |
| 2.032610446872609 | 0.406 | -0.203 | -0.059 |
| 2.035752039526198 | 0.406 | -0.203 | -0.056 |
| 2.038893632179788 | 0.406 | -0.203 | -0.053 |
| 2.042035224833378 | 0.406 | -0.203 | -0.05 |
| 2.045176817486967 | 0.406 | -0.203 | -0.048 |
| 2.048318410140557 | 0.406 | -0.203 | -0.045 |
| 2.051460002794146 | 0.406 | -0.203 | -0.042 |
| 2.054601595447736 | 0.406 | -0.203 | -0.039 |
| 2.057743188101325 | 0.406 | -0.203 | -0.036 |
| 2.060884780754915 | 0.406 | -0.203 | -0.033 |
| 2.064026373408505 | 0.406 | -0.203 | -0.03 |
| 2.067167966062094 | 0.406 | -0.203 | -0.027 |
| 2.070309558715684 | 0.406 | -0.203 | -0.024 |
| 2.073451151369273 | 0.406 | -0.203 | -0.021 |
| 2.076592744022863 | 0.406 | -0.203 | -0.018 |
| 2.079734336676452 | 0.406 | -0.203 | -0.015 |
| 2.082875929330042 | 0.406 | -0.203 | -0.011 |
| 2.086017521983632 | 0.406 | -0.203 | -0.008 |
| 2.089159114637221 | 0.406 | -0.203 | -0.005 |
| 2.092300707290811 | 0.406 | -0.203 | -0.002 |
| 2.095442299944401 | 0.406 | -0.203 | 0.001 |
| 2.09858389259799 | 0.406 | -0.203 | 0.004 |
| 2.10172548525158 | 0.406 | -0.203 | 0.007 |
| 2.104867077905169 | 0.406 | -0.203 | 0.01 |
| 2.108008670558759 | 0.406 | -0.203 | 0.014 |
| 2.111150263212349 | 0.406 | -0.203 | 0.017 |
| 2.114291855865938 | 0.406 | -0.203 | 0.02 |
| 2.117433448519528 | 0.406 | -0.203 | 0.023 |
| 2.120575041173117 | 0.406 | -0.203 | 0.026 |
| 2.123716633826707 | 0.406 | -0.203 | 0.029 |
| 2.126858226480297 | 0.406 | -0.203 | 0.032 |
| 2.129999819133886 | 0.406 | -0.203 | 0.035 |
| 2.133141411787476 | 0.406 | -0.203 | 0.038 |
| 2.136283004441065 | 0.406 | -0.203 | 0.041 |
| 2.139424597094655 | 0.406 | -0.203 | 0.044 |
| 2.142566189748245 | 0.406 | -0.203 | 0.047 |
| 2.145707782401834 | 0.406 | -0.203 | 0.05 |
| 2.148849375055424 | 0.406 | -0.203 | 0.052 |
| 2.151990967709013 | 0.406 | -0.203 | 0.055 |
| 2.155132560362603 | 0.406 | -0.203 | 0.058 |
| 2.158274153016193 | 0.406 | -0.203 | 0.061 |
| 2.161415745669782 | 0.406 | -0.203 | 0.063 |
| 2.164557338323372 | 0.406 | -0.203 | 0.066 |
| 2.167698930976961 | 0.406 | -0.203 | 0.068 |
| 2.170840523630551 | 0.406 | -0.203 | 0.071 |
| 2.173982116284141 | 0.406 | -0.203 | 0.073 |
| 2.17712370893773 | 0.406 | -0.203 | 0.076 |
| 2.18026530159132 | 0.406 | -0.203 | 0.078 |
| 2.183406894244909 | 0.406 | -0.203 | 0.08 |
| 2.186548486898499 | 0.406 | -0.203 | 0.083 |
| 2.189690079552089 | 0.406 | -0.203 | 0.085 |
| 2.192831672205678 | 0.406 | -0.203 | 0.087 |
| 2.195973264859268 | 0.406 | -0.203 | 0.089 |
| 2.199114857512857 | 0.406 | -0.203 | 0.091 |
| 2.202256450166447 | 0.406 | -0.203 | 0.093 |
| 2.205398042820036 | 0.406 | -0.203 | 0.095 |
| 2.208539635473626 | 0.406 | -0.203 | 0.097 |
| 2.211681228127216 | 0.406 | -0.203 | 0.099 |
| 2.214822820780805 | 0.406 | -0.203 | 0.1 |
| 2.217964413434395 | 0.406 | -0.203 | 0.102 |
| 2.221106006087984 | 0.406 | -0.203 | 0.104 |
| 2.224247598741574 | 0.406 | -0.203 | 0.105 |
| 2.227389191395164 | 0.405 | -0.203 | 0.107 |
| 2.230530784048753 | 0.405 | -0.203 | 0.108 |
| 2.233672376702343 | 0.405 | -0.203 | 0.11 |
| 2.236813969355933 | 0.405 | -0.203 | 0.111 |
| 2.239955562009522 | 0.405 | -0.203 | 0.112 |
| 2.243097154663112 | 0.405 | -0.203 | 0.114 |
| 2.246238747316701 | 0.405 | -0.203 | 0.115 |
| 2.249380339970291 | 0.405 | -0.203 | 0.116 |
| 2.252521932623881 | 0.405 | -0.203 | 0.117 |
| 2.25566352527747 | 0.405 | -0.203 | 0.118 |
| 2.25880511793106 | 0.405 | -0.203 | 0.119 |
| 2.261946710584649 | 0.405 | -0.203 | 0.12 |
| 2.265088303238239 | 0.405 | -0.203 | 0.121 |
| 2.268229895891829 | 0.405 | -0.203 | 0.122 |
| 2.271371488545418 | 0.405 | -0.203 | 0.123 |
| 2.274513081199008 | 0.405 | -0.203 | 0.124 |
| 2.277654673852597 | 0.405 | -0.203 | 0.124 |
| 2.280796266506186 | 0.405 | -0.203 | 0.125 |
| 2.283937859159776 | 0.405 | -0.203 | 0.126 |
| 2.287079451813366 | 0.404 | -0.203 | 0.127 |
| 2.290221044466955 | 0.404 | -0.203 | 0.127 |
| 2.293362637120545 | 0.404 | -0.203 | 0.128 |
| 2.296504229774135 | 0.404 | -0.203 | 0.128 |
| 2.299645822427724 | 0.404 | -0.203 | 0.129 |
| 2.302787415081314 | 0.404 | -0.203 | 0.129 |
| 2.305929007734904 | 0.404 | -0.203 | 0.13 |
| 2.309070600388493 | 0.404 | -0.203 | 0.13 |
| 2.312212193042083 | 0.404 | -0.203 | 0.131 |
| 2.315353785695672 | 0.404 | -0.203 | 0.131 |
| 2.318495378349262 | 0.404 | -0.203 | 0.131 |
| 2.321636971002852 | 0.404 | -0.203 | 0.132 |
| 2.324778563656441 | 0.403 | -0.203 | 0.132 |
| 2.327920156310031 | 0.403 | -0.203 | 0.132 |
| 2.33106174896362 | 0.403 | -0.203 | 0.133 |
| 2.33420334161721 | 0.403 | -0.203 | 0.133 |
| 2.3373449342708 | 0.403 | -0.203 | 0.133 |
| 2.340486526924389 | 0.403 | -0.203 | 0.133 |
| 2.343628119577979 | 0.403 | -0.203 | 0.133 |
| 2.346769712231568 | 0.403 | -0.203 | 0.134 |
| 2.349911304885158 | 0.403 | -0.203 | 0.134 |
| 2.353052897538748 | 0.402 | -0.203 | 0.134 |
| 2.356194490192337 | 0.402 | -0.203 | 0.134 |
| 2.359336082845927 | 0.402 | -0.203 | 0.134 |
| 2.362477675499516 | 0.402 | -0.203 | 0.134 |
| 2.365619268153106 | 0.402 | -0.203 | 0.134 |
| 2.368760860806696 | 0.402 | -0.203 | 0.135 |
| 2.371902453460285 | 0.401 | -0.203 | 0.135 |
| 2.375044046113875 | 0.401 | -0.203 | 0.135 |
| 2.378185638767464 | 0.401 | -0.203 | 0.135 |
| 2.381327231421054 | 0.401 | -0.203 | 0.135 |
| 2.384468824074644 | 0.401 | -0.203 | 0.135 |
| 2.387610416728233 | 0.401 | -0.203 | 0.135 |
| 2.390752009381823 | 0.4 | -0.203 | 0.135 |
| 2.393893602035412 | 0.4 | -0.203 | 0.135 |
| 2.397035194689002 | 0.4 | -0.203 | 0.135 |
| 2.400176787342591 | 0.4 | -0.203 | 0.135 |
| 2.403318379996181 | 0.4 | -0.203 | 0.135 |
| 2.406459972649771 | 0.399 | -0.203 | 0.135 |
| 2.40960156530336 | 0.399 | -0.203 | 0.135 |
| 2.41274315795695 | 0.399 | -0.203 | 0.135 |
| 2.41588475061054 | 0.399 | -0.203 | 0.135 |
| 2.419026343264129 | 0.399 | -0.203 | 0.135 |
| 2.422167935917719 | 0.398 | -0.203 | 0.135 |
| 2.425309528571308 | 0.398 | -0.203 | 0.135 |
| 2.428451121224898 | 0.398 | -0.203 | 0.135 |
| 2.431592713878488 | 0.398 | -0.203 | 0.135 |
| 2.434734306532077 | 0.397 | -0.203 | 0.135 |
| 2.437875899185667 | 0.397 | -0.203 | 0.135 |
| 2.441017491839256 | 0.397 | -0.203 | 0.135 |
| 2.444159084492846 | 0.396 | -0.203 | 0.135 |
| 2.447300677146435 | 0.396 | -0.203 | 0.135 |
| 2.450442269800025 | 0.396 | -0.203 | 0.135 |
| 2.453583862453615 | 0.396 | -0.203 | 0.135 |
| 2.456725455107204 | 0.395 | -0.203 | 0.135 |
| 2.459867047760794 | 0.395 | -0.203 | 0.135 |
| 2.463008640414384 | 0.395 | -0.203 | 0.135 |
| 2.466150233067973 | 0.394 | -0.203 | 0.135 |
| 2.469291825721563 | 0.394 | -0.203 | 0.135 |
| 2.472433418375152 | 0.394 | -0.203 | 0.135 |
| 2.475575011028742 | 0.393 | -0.203 | 0.135 |
| 2.478716603682332 | 0.393 | -0.203 | 0.135 |
| 2.481858196335921 | 0.392 | -0.203 | 0.135 |
| 2.48499978898951 | 0.392 | -0.203 | 0.135 |
| 2.4881413816431 | 0.392 | -0.203 | 0.135 |
| 2.49128297429669 | 0.391 | -0.203 | 0.135 |
| 2.49442456695028 | 0.391 | -0.203 | 0.135 |
| 2.497566159603869 | 0.391 | -0.203 | 0.135 |
| 2.500707752257458 | 0.39 | -0.203 | 0.135 |
| 2.503849344911048 | 0.39 | -0.203 | 0.135 |
| 2.506990937564638 | 0.389 | -0.203 | 0.135 |
| 2.510132530218228 | 0.389 | -0.203 | 0.135 |
| 2.513274122871817 | 0.388 | -0.203 | 0.135 |
| 2.516415715525407 | 0.388 | -0.203 | 0.135 |
| 2.519557308178996 | 0.387 | -0.203 | 0.135 |
| 2.522698900832586 | 0.387 | -0.203 | 0.135 |
| 2.525840493486176 | 0.386 | -0.203 | 0.135 |
| 2.528982086139765 | 0.386 | -0.203 | 0.135 |
| 2.532123678793355 | 0.385 | -0.203 | 0.135 |
| 2.535265271446944 | 0.385 | -0.203 | 0.135 |
| 2.538406864100534 | 0.384 | -0.203 | 0.135 |
| 2.541548456754124 | 0.384 | -0.203 | 0.135 |
| 2.544690049407713 | 0.383 | -0.203 | 0.135 |
| 2.547831642061302 | 0.383 | -0.203 | 0.135 |
| 2.550973234714892 | 0.382 | -0.203 | 0.135 |
| 2.554114827368482 | 0.381 | -0.203 | 0.135 |
| 2.557256420022072 | 0.381 | -0.203 | 0.135 |
| 2.560398012675661 | 0.38 | -0.203 | 0.135 |
| 2.563539605329251 | 0.38 | -0.203 | 0.135 |
| 2.56668119798284 | 0.379 | -0.203 | 0.135 |
| 2.56982279063643 | 0.378 | -0.203 | 0.135 |
| 2.57296438329002 | 0.378 | -0.203 | 0.135 |
| 2.576105975943609 | 0.377 | -0.203 | 0.135 |
| 2.579247568597199 | 0.376 | -0.203 | 0.135 |
| 2.582389161250788 | 0.375 | -0.203 | 0.135 |
| 2.585530753904377 | 0.375 | -0.203 | 0.135 |
| 2.588672346557967 | 0.374 | -0.203 | 0.135 |
| 2.591813939211557 | 0.373 | -0.203 | 0.135 |
| 2.594955531865147 | 0.373 | -0.203 | 0.135 |
| 2.598097124518736 | 0.372 | -0.203 | 0.135 |
| 2.601238717172326 | 0.371 | -0.203 | 0.135 |
| 2.604380309825915 | 0.37 | -0.203 | 0.135 |
| 2.607521902479505 | 0.369 | -0.203 | 0.135 |
| 2.610663495133095 | 0.369 | -0.203 | 0.135 |
| 2.613805087786684 | 0.368 | -0.203 | 0.135 |
| 2.616946680440274 | 0.367 | -0.203 | 0.135 |
| 2.620088273093863 | 0.366 | -0.203 | 0.135 |
| 2.623229865747452 | 0.365 | -0.203 | 0.135 |
| 2.626371458401042 | 0.364 | -0.203 | 0.135 |
| 2.629513051054632 | 0.363 | -0.203 | 0.135 |
| 2.632654643708222 | 0.362 | -0.203 | 0.135 |
| 2.635796236361811 | 0.361 | -0.203 | 0.135 |
| 2.638937829015401 | 0.361 | -0.203 | 0.135 |
| 2.642079421668991 | 0.36 | -0.203 | 0.135 |
| 2.64522101432258 | 0.359 | -0.203 | 0.135 |
| 2.64836260697617 | 0.358 | -0.203 | 0.135 |
| 2.651504199629759 | 0.357 | -0.203 | 0.135 |
| 2.654645792283349 | 0.356 | -0.203 | 0.135 |
| 2.657787384936938 | 0.355 | -0.203 | 0.135 |
| 2.660928977590528 | 0.353 | -0.203 | 0.135 |
| 2.664070570244118 | 0.352 | -0.203 | 0.135 |
| 2.667212162897707 | 0.351 | -0.203 | 0.135 |
| 2.670353755551297 | 0.35 | -0.203 | 0.135 |
| 2.673495348204887 | 0.349 | -0.203 | 0.135 |
| 2.676636940858476 | 0.348 | -0.203 | 0.135 |
| 2.679778533512066 | 0.347 | -0.203 | 0.135 |
| 2.682920126165655 | 0.346 | -0.203 | 0.135 |
| 2.686061718819245 | 0.344 | -0.203 | 0.135 |
| 2.689203311472835 | 0.343 | -0.203 | 0.135 |
| 2.692344904126424 | 0.342 | -0.203 | 0.135 |
| 2.695486496780014 | 0.341 | -0.203 | 0.135 |
| 2.698628089433603 | 0.34 | -0.203 | 0.135 |
| 2.701769682087193 | 0.338 | -0.202 | 0.135 |
| 2.704911274740782 | 0.337 | -0.202 | 0.135 |
| 2.708052867394372 | 0.336 | -0.202 | 0.135 |
| 2.711194460047962 | 0.334 | -0.202 | 0.135 |
| 2.714336052701551 | 0.333 | -0.202 | 0.135 |
| 2.717477645355141 | 0.332 | -0.202 | 0.135 |
| 2.720619238008731 | 0.33 | -0.202 | 0.135 |
| 2.72376083066232 | 0.329 | -0.202 | 0.135 |
| 2.72690242331591 | 0.327 | -0.202 | 0.135 |
| 2.730044015969499 | 0.326 | -0.202 | 0.135 |
| 2.733185608623089 | 0.325 | -0.202 | 0.135 |
| 2.736327201276678 | 0.323 | -0.202 | 0.135 |
| 2.739468793930268 | 0.322 | -0.202 | 0.135 |
| 2.742610386583858 | 0.32 | -0.201 | 0.135 |
| 2.745751979237447 | 0.319 | -0.201 | 0.135 |
| 2.748893571891036 | 0.317 | -0.201 | 0.135 |
| 2.752035164544627 | 0.316 | -0.201 | 0.135 |
| 2.755176757198216 | 0.314 | -0.201 | 0.135 |
| 2.758318349851806 | 0.312 | -0.201 | 0.135 |
| 2.761459942505395 | 0.311 | -0.2 | 0.135 |
| 2.764601535158985 | 0.309 | -0.2 | 0.135 |
| 2.767743127812574 | 0.308 | -0.2 | 0.135 |
| 2.770884720466164 | 0.306 | -0.2 | 0.135 |
| 2.774026313119754 | 0.304 | -0.2 | 0.135 |
| 2.777167905773343 | 0.303 | -0.2 | 0.135 |
| 2.780309498426932 | 0.301 | -0.199 | 0.135 |
| 2.783451091080522 | 0.299 | -0.199 | 0.135 |
| 2.786592683734112 | 0.297 | -0.199 | 0.135 |
| 2.789734276387701 | 0.296 | -0.199 | 0.135 |
| 2.792875869041291 | 0.294 | -0.198 | 0.135 |
| 2.796017461694881 | 0.292 | -0.198 | 0.135 |
| 2.79915905434847 | 0.29 | -0.198 | 0.135 |
| 2.80230064700206 | 0.288 | -0.197 | 0.135 |
| 2.80544223965565 | 0.286 | -0.197 | 0.135 |
| 2.808583832309239 | 0.285 | -0.197 | 0.135 |
| 2.811725424962829 | 0.283 | -0.196 | 0.135 |
| 2.814867017616419 | 0.281 | -0.196 | 0.135 |
| 2.818008610270008 | 0.279 | -0.195 | 0.135 |
| 2.821150202923598 | 0.277 | -0.195 | 0.135 |
| 2.824291795577187 | 0.275 | -0.195 | 0.135 |
| 2.827433388230777 | 0.273 | -0.194 | 0.135 |
| 2.830574980884366 | 0.271 | -0.194 | 0.135 |
| 2.833716573537956 | 0.269 | -0.193 | 0.135 |
| 2.836858166191546 | 0.267 | -0.193 | 0.135 |
| 2.839999758845135 | 0.265 | -0.192 | 0.135 |
| 2.843141351498725 | 0.263 | -0.192 | 0.135 |
| 2.846282944152314 | 0.261 | -0.191 | 0.135 |
| 2.849424536805904 | 0.258 | -0.19 | 0.135 |
| 2.852566129459494 | 0.256 | -0.19 | 0.135 |
| 2.855707722113083 | 0.254 | -0.189 | 0.135 |
| 2.858849314766673 | 0.252 | -0.188 | 0.135 |
| 2.861990907420262 | 0.25 | -0.188 | 0.135 |
| 2.865132500073852 | 0.248 | -0.187 | 0.135 |
| 2.868274092727442 | 0.245 | -0.186 | 0.135 |
| 2.871415685381031 | 0.243 | -0.185 | 0.134 |
| 2.874557278034621 | 0.241 | -0.185 | 0.134 |
| 2.87769887068821 | 0.239 | -0.184 | 0.134 |
| 2.8808404633418 | 0.236 | -0.183 | 0.134 |
| 2.88398205599539 | 0.234 | -0.182 | 0.134 |
| 2.88712364864898 | 0.232 | -0.181 | 0.134 |
| 2.890265241302569 | 0.229 | -0.18 | 0.134 |
| 2.893406833956158 | 0.227 | -0.179 | 0.133 |
| 2.896548426609748 | 0.225 | -0.178 | 0.133 |
| 2.899690019263338 | 0.222 | -0.177 | 0.133 |
| 2.902831611916927 | 0.22 | -0.176 | 0.133 |
| 2.905973204570517 | 0.217 | -0.175 | 0.132 |
| 2.909114797224106 | 0.215 | -0.174 | 0.132 |
| 2.912256389877696 | 0.212 | -0.173 | 0.132 |
| 2.915397982531286 | 0.21 | -0.172 | 0.132 |
| 2.918539575184875 | 0.207 | -0.17 | 0.131 |
| 2.921681167838465 | 0.205 | -0.169 | 0.131 |
| 2.924822760492054 | 0.202 | -0.168 | 0.13 |
| 2.927964353145644 | 0.2 | -0.167 | 0.13 |
| 2.931105945799234 | 0.197 | -0.165 | 0.13 |
| 2.934247538452823 | 0.195 | -0.164 | 0.129 |
| 2.937389131106413 | 0.192 | -0.162 | 0.129 |
| 2.940530723760002 | 0.189 | -0.161 | 0.128 |
| 2.943672316413592 | 0.187 | -0.159 | 0.128 |
| 2.946813909067182 | 0.184 | -0.158 | 0.127 |
| 2.949955501720771 | 0.182 | -0.156 | 0.126 |
| 2.953097094374361 | 0.179 | -0.155 | 0.126 |
| 2.95623868702795 | 0.176 | -0.153 | 0.125 |
| 2.95938027968154 | 0.174 | -0.151 | 0.124 |
| 2.96252187233513 | 0.171 | -0.15 | 0.123 |
| 2.965663464988719 | 0.168 | -0.148 | 0.123 |
| 2.968805057642309 | 0.165 | -0.146 | 0.122 |
| 2.971946650295898 | 0.163 | -0.144 | 0.121 |
| 2.975088242949488 | 0.16 | -0.142 | 0.12 |
| 2.978229835603078 | 0.157 | -0.14 | 0.119 |
| 2.981371428256667 | 0.154 | -0.138 | 0.118 |
| 2.984513020910257 | 0.151 | -0.136 | 0.117 |
| 2.987654613563846 | 0.149 | -0.134 | 0.116 |
| 2.990796206217436 | 0.146 | -0.132 | 0.114 |
| 2.993937798871025 | 0.143 | -0.13 | 0.113 |
| 2.997079391524615 | 0.14 | -0.128 | 0.112 |
| 3.000220984178205 | 0.137 | -0.126 | 0.111 |
| 3.003362576831794 | 0.134 | -0.124 | 0.109 |
| 3.006504169485384 | 0.131 | -0.122 | 0.108 |
| 3.009645762138974 | 0.129 | -0.119 | 0.106 |
| 3.012787354792563 | 0.126 | -0.117 | 0.105 |
| 3.015928947446153 | 0.123 | -0.115 | 0.103 |
| 3.019070540099742 | 0.12 | -0.112 | 0.101 |
| 3.022212132753332 | 0.117 | -0.11 | 0.1 |
| 3.025353725406922 | 0.114 | -0.107 | 0.098 |
| 3.028495318060511 | 0.111 | -0.105 | 0.096 |
| 3.031636910714101 | 0.108 | -0.102 | 0.094 |
| 3.03477850336769 | 0.105 | -0.1 | 0.092 |
| 3.03792009602128 | 0.102 | -0.097 | 0.09 |
| 3.04106168867487 | 0.099 | -0.095 | 0.088 |
| 3.04420328132846 | 0.096 | -0.092 | 0.086 |
| 3.047344873982049 | 0.093 | -0.089 | 0.084 |
| 3.050486466635638 | 0.09 | -0.087 | 0.082 |
| 3.053628059289228 | 0.087 | -0.084 | 0.08 |
| 3.056769651942818 | 0.084 | -0.081 | 0.077 |
| 3.059911244596407 | 0.081 | -0.079 | 0.075 |
| 3.063052837249997 | 0.078 | -0.076 | 0.072 |
| 3.066194429903586 | 0.075 | -0.073 | 0.07 |
| 3.069336022557176 | 0.072 | -0.07 | 0.067 |
| 3.072477615210766 | 0.069 | -0.067 | 0.065 |
| 3.075619207864355 | 0.066 | -0.064 | 0.062 |
| 3.078760800517945 | 0.062 | -0.061 | 0.06 |
| 3.081902393171534 | 0.059 | -0.058 | 0.057 |
| 3.085043985825124 | 0.056 | -0.055 | 0.054 |
| 3.088185578478713 | 0.053 | -0.053 | 0.051 |
| 3.091327171132303 | 0.05 | -0.05 | 0.049 |
| 3.094468763785893 | 0.047 | -0.047 | 0.046 |
| 3.097610356439482 | 0.044 | -0.043 | 0.043 |
| 3.100751949093072 | 0.041 | -0.04 | 0.04 |
| 3.103893541746661 | 0.038 | -0.037 | 0.037 |
| 3.107035134400251 | 0.034 | -0.034 | 0.034 |
| 3.110176727053841 | 0.031 | -0.031 | 0.031 |
| 3.11331831970743 | 0.028 | -0.028 | 0.028 |
| 3.11645991236102 | 0.025 | -0.025 | 0.025 |
| 3.11960150501461 | 0.022 | -0.022 | 0.022 |
| 3.122743097668199 | 0.019 | -0.019 | 0.019 |
| 3.125884690321789 | 0.016 | -0.016 | 0.016 |
| 3.129026282975378 | 0.013 | -0.013 | 0.013 |
| 3.132167875628968 | 0.009 | -0.009 | 0.009 |
| 3.135309468282557 | 0.006 | -0.006 | 0.006 |
| 3.138451060936147 | 0.003 | -0.003 | 0.003 |
| 3.141592653589737 | 0 | 0 | 0 |
| 3.144734246243326 | -0.003 | 0.003 | -0.003 |
| 3.147875838896916 | -0.006 | 0.006 | -0.006 |
| 3.151017431550505 | -0.009 | 0.009 | -0.009 |
| 3.154159024204095 | -0.013 | 0.013 | -0.013 |
| 3.157300616857685 | -0.016 | 0.016 | -0.016 |
| 3.160442209511274 | -0.019 | 0.019 | -0.019 |
| 3.163583802164864 | -0.022 | 0.022 | -0.022 |
| 3.166725394818453 | -0.025 | 0.025 | -0.025 |
| 3.169866987472043 | -0.028 | 0.028 | -0.028 |
| 3.173008580125633 | -0.031 | 0.031 | -0.031 |
| 3.176150172779222 | -0.034 | 0.034 | -0.034 |
| 3.179291765432812 | -0.038 | 0.037 | -0.037 |
| 3.182433358086401 | -0.041 | 0.04 | -0.04 |
| 3.185574950739991 | -0.044 | 0.043 | -0.043 |
| 3.188716543393581 | -0.047 | 0.047 | -0.046 |
| 3.19185813604717 | -0.05 | 0.05 | -0.049 |
| 3.19499972870076 | -0.053 | 0.053 | -0.051 |
| 3.198141321354349 | -0.056 | 0.055 | -0.054 |
| 3.20128291400794 | -0.059 | 0.058 | -0.057 |
| 3.204424506661528 | -0.062 | 0.061 | -0.06 |
| 3.207566099315118 | -0.066 | 0.064 | -0.062 |
| 3.210707691968708 | -0.069 | 0.067 | -0.065 |
| 3.213849284622297 | -0.072 | 0.07 | -0.067 |
| 3.216990877275887 | -0.075 | 0.073 | -0.07 |
| 3.220132469929476 | -0.078 | 0.076 | -0.072 |
| 3.223274062583066 | -0.081 | 0.079 | -0.075 |
| 3.226415655236656 | -0.084 | 0.081 | -0.077 |
| 3.229557247890245 | -0.087 | 0.084 | -0.08 |
| 3.232698840543835 | -0.09 | 0.087 | -0.082 |
| 3.235840433197425 | -0.093 | 0.089 | -0.084 |
| 3.238982025851014 | -0.096 | 0.092 | -0.086 |
| 3.242123618504604 | -0.099 | 0.095 | -0.088 |
| 3.245265211158193 | -0.102 | 0.097 | -0.09 |
| 3.248406803811783 | -0.105 | 0.1 | -0.092 |
| 3.251548396465373 | -0.108 | 0.102 | -0.094 |
| 3.254689989118962 | -0.111 | 0.105 | -0.096 |
| 3.257831581772551 | -0.114 | 0.107 | -0.098 |
| 3.260973174426141 | -0.117 | 0.11 | -0.1 |
| 3.26411476707973 | -0.12 | 0.112 | -0.101 |
| 3.267256359733321 | -0.123 | 0.115 | -0.103 |
| 3.27039795238691 | -0.126 | 0.117 | -0.105 |
| 3.2735395450405 | -0.129 | 0.119 | -0.106 |
| 3.276681137694089 | -0.131 | 0.122 | -0.108 |
| 3.279822730347679 | -0.134 | 0.124 | -0.109 |
| 3.282964323001269 | -0.137 | 0.126 | -0.111 |
| 3.286105915654858 | -0.14 | 0.128 | -0.112 |
| 3.289247508308448 | -0.143 | 0.13 | -0.113 |
| 3.292389100962037 | -0.146 | 0.132 | -0.114 |
| 3.295530693615627 | -0.149 | 0.134 | -0.116 |
| 3.298672286269217 | -0.151 | 0.136 | -0.117 |
| 3.301813878922806 | -0.154 | 0.138 | -0.118 |
| 3.304955471576396 | -0.157 | 0.14 | -0.119 |
| 3.308097064229985 | -0.16 | 0.142 | -0.12 |
| 3.311238656883575 | -0.163 | 0.144 | -0.121 |
| 3.314380249537165 | -0.165 | 0.146 | -0.122 |
| 3.317521842190754 | -0.168 | 0.148 | -0.123 |
| 3.320663434844344 | -0.171 | 0.15 | -0.123 |
| 3.323805027497933 | -0.174 | 0.151 | -0.124 |
| 3.326946620151523 | -0.176 | 0.153 | -0.125 |
| 3.330088212805113 | -0.179 | 0.155 | -0.126 |
| 3.333229805458702 | -0.182 | 0.156 | -0.126 |
| 3.336371398112292 | -0.184 | 0.158 | -0.127 |
| 3.339512990765881 | -0.187 | 0.159 | -0.128 |
| 3.342654583419471 | -0.189 | 0.161 | -0.128 |
| 3.345796176073061 | -0.192 | 0.162 | -0.129 |
| 3.34893776872665 | -0.195 | 0.164 | -0.129 |
| 3.35207936138024 | -0.197 | 0.165 | -0.13 |
| 3.355220954033829 | -0.2 | 0.167 | -0.13 |
| 3.358362546687419 | -0.202 | 0.168 | -0.13 |
| 3.361504139341009 | -0.205 | 0.169 | -0.131 |
| 3.364645731994598 | -0.207 | 0.17 | -0.131 |
| 3.367787324648188 | -0.21 | 0.172 | -0.132 |
| 3.370928917301777 | -0.212 | 0.173 | -0.132 |
| 3.374070509955367 | -0.215 | 0.174 | -0.132 |
| 3.377212102608956 | -0.217 | 0.175 | -0.132 |
| 3.380353695262546 | -0.22 | 0.176 | -0.133 |
| 3.383495287916136 | -0.222 | 0.177 | -0.133 |
| 3.386636880569725 | -0.225 | 0.178 | -0.133 |
| 3.389778473223315 | -0.227 | 0.179 | -0.133 |
| 3.392920065876904 | -0.229 | 0.18 | -0.134 |
| 3.396061658530494 | -0.232 | 0.181 | -0.134 |
| 3.399203251184084 | -0.234 | 0.182 | -0.134 |
| 3.402344843837673 | -0.236 | 0.183 | -0.134 |
| 3.405486436491263 | -0.239 | 0.184 | -0.134 |
| 3.408628029144852 | -0.241 | 0.185 | -0.134 |
| 3.411769621798442 | -0.243 | 0.185 | -0.134 |
| 3.414911214452032 | -0.245 | 0.186 | -0.135 |
| 3.418052807105621 | -0.248 | 0.187 | -0.135 |
| 3.421194399759211 | -0.25 | 0.188 | -0.135 |
| 3.4243359924128 | -0.252 | 0.188 | -0.135 |
| 3.42747758506639 | -0.254 | 0.189 | -0.135 |
| 3.43061917771998 | -0.256 | 0.19 | -0.135 |
| 3.433760770373569 | -0.258 | 0.19 | -0.135 |
| 3.436902363027159 | -0.261 | 0.191 | -0.135 |
| 3.440043955680748 | -0.263 | 0.192 | -0.135 |
| 3.443185548334338 | -0.265 | 0.192 | -0.135 |
| 3.446327140987927 | -0.267 | 0.193 | -0.135 |
| 3.449468733641517 | -0.269 | 0.193 | -0.135 |
| 3.452610326295107 | -0.271 | 0.194 | -0.135 |
| 3.455751918948696 | -0.273 | 0.194 | -0.135 |
| 3.458893511602286 | -0.275 | 0.195 | -0.135 |
| 3.462035104255876 | -0.277 | 0.195 | -0.135 |
| 3.465176696909465 | -0.279 | 0.195 | -0.135 |
| 3.468318289563055 | -0.281 | 0.196 | -0.135 |
| 3.471459882216644 | -0.283 | 0.196 | -0.135 |
| 3.474601474870234 | -0.285 | 0.197 | -0.135 |
| 3.477743067523824 | -0.286 | 0.197 | -0.135 |
| 3.480884660177413 | -0.288 | 0.197 | -0.135 |
| 3.484026252831002 | -0.29 | 0.198 | -0.135 |
| 3.487167845484592 | -0.292 | 0.198 | -0.135 |
| 3.490309438138182 | -0.294 | 0.198 | -0.135 |
| 3.493451030791772 | -0.296 | 0.199 | -0.135 |
| 3.496592623445361 | -0.297 | 0.199 | -0.135 |
| 3.499734216098951 | -0.299 | 0.199 | -0.135 |
| 3.50287580875254 | -0.301 | 0.199 | -0.135 |
| 3.50601740140613 | -0.303 | 0.2 | -0.135 |
| 3.50915899405972 | -0.304 | 0.2 | -0.135 |
| 3.512300586713309 | -0.306 | 0.2 | -0.135 |
| 3.515442179366899 | -0.308 | 0.2 | -0.135 |
| 3.518583772020488 | -0.309 | 0.2 | -0.135 |
| 3.521725364674078 | -0.311 | 0.2 | -0.135 |
| 3.524866957327668 | -0.312 | 0.201 | -0.135 |
| 3.528008549981257 | -0.314 | 0.201 | -0.135 |
| 3.531150142634847 | -0.316 | 0.201 | -0.135 |
| 3.534291735288436 | -0.317 | 0.201 | -0.135 |
| 3.537433327942026 | -0.319 | 0.201 | -0.135 |
| 3.540574920595616 | -0.32 | 0.201 | -0.135 |
| 3.543716513249205 | -0.322 | 0.202 | -0.135 |
| 3.546858105902795 | -0.323 | 0.202 | -0.135 |
| 3.549999698556384 | -0.325 | 0.202 | -0.135 |
| 3.553141291209974 | -0.326 | 0.202 | -0.135 |
| 3.556282883863564 | -0.327 | 0.202 | -0.135 |
| 3.559424476517153 | -0.329 | 0.202 | -0.135 |
| 3.562566069170743 | -0.33 | 0.202 | -0.135 |
| 3.565707661824332 | -0.332 | 0.202 | -0.135 |
| 3.568849254477922 | -0.333 | 0.202 | -0.135 |
| 3.571990847131511 | -0.334 | 0.202 | -0.135 |
| 3.575132439785101 | -0.336 | 0.202 | -0.135 |
| 3.578274032438691 | -0.337 | 0.202 | -0.135 |
| 3.58141562509228 | -0.338 | 0.202 | -0.135 |
| 3.58455721774587 | -0.34 | 0.203 | -0.135 |
| 3.58769881039946 | -0.341 | 0.203 | -0.135 |
| 3.590840403053049 | -0.342 | 0.203 | -0.135 |
| 3.593981995706639 | -0.343 | 0.203 | -0.135 |
| 3.597123588360228 | -0.344 | 0.203 | -0.135 |
| 3.600265181013818 | -0.346 | 0.203 | -0.135 |
| 3.603406773667407 | -0.347 | 0.203 | -0.135 |
| 3.606548366320997 | -0.348 | 0.203 | -0.135 |
| 3.609689958974587 | -0.349 | 0.203 | -0.135 |
| 3.612831551628176 | -0.35 | 0.203 | -0.135 |
| 3.615973144281766 | -0.351 | 0.203 | -0.135 |
| 3.619114736935355 | -0.352 | 0.203 | -0.135 |
| 3.622256329588945 | -0.353 | 0.203 | -0.135 |
| 3.625397922242534 | -0.355 | 0.203 | -0.135 |
| 3.628539514896124 | -0.356 | 0.203 | -0.135 |
| 3.631681107549714 | -0.357 | 0.203 | -0.135 |
| 3.634822700203303 | -0.358 | 0.203 | -0.135 |
| 3.637964292856893 | -0.359 | 0.203 | -0.135 |
| 3.641105885510483 | -0.36 | 0.203 | -0.135 |
| 3.644247478164072 | -0.361 | 0.203 | -0.135 |
| 3.647389070817662 | -0.361 | 0.203 | -0.135 |
| 3.650530663471251 | -0.362 | 0.203 | -0.135 |
| 3.653672256124841 | -0.363 | 0.203 | -0.135 |
| 3.656813848778431 | -0.364 | 0.203 | -0.135 |
| 3.65995544143202 | -0.365 | 0.203 | -0.135 |
| 3.66309703408561 | -0.366 | 0.203 | -0.135 |
| 3.666238626739199 | -0.367 | 0.203 | -0.135 |
| 3.66938021939279 | -0.368 | 0.203 | -0.135 |
| 3.672521812046378 | -0.369 | 0.203 | -0.135 |
| 3.675663404699968 | -0.369 | 0.203 | -0.135 |
| 3.678804997353558 | -0.37 | 0.203 | -0.135 |
| 3.681946590007147 | -0.371 | 0.203 | -0.135 |
| 3.685088182660737 | -0.372 | 0.203 | -0.135 |
| 3.688229775314326 | -0.373 | 0.203 | -0.135 |
| 3.691371367967916 | -0.373 | 0.203 | -0.135 |
| 3.694512960621506 | -0.374 | 0.203 | -0.135 |
| 3.697654553275095 | -0.375 | 0.203 | -0.135 |
| 3.700796145928685 | -0.375 | 0.203 | -0.135 |
| 3.703937738582274 | -0.376 | 0.203 | -0.135 |
| 3.707079331235864 | -0.377 | 0.203 | -0.135 |
| 3.710220923889454 | -0.378 | 0.203 | -0.135 |
| 3.713362516543043 | -0.378 | 0.203 | -0.135 |
| 3.716504109196633 | -0.379 | 0.203 | -0.135 |
| 3.719645701850223 | -0.38 | 0.203 | -0.135 |
| 3.722787294503812 | -0.38 | 0.203 | -0.135 |
| 3.725928887157402 | -0.381 | 0.203 | -0.135 |
| 3.729070479810991 | -0.381 | 0.203 | -0.135 |
| 3.732212072464581 | -0.382 | 0.203 | -0.135 |
| 3.735353665118171 | -0.383 | 0.203 | -0.135 |
| 3.73849525777176 | -0.383 | 0.203 | -0.135 |
| 3.74163685042535 | -0.384 | 0.203 | -0.135 |
| 3.744778443078939 | -0.384 | 0.203 | -0.135 |
| 3.747920035732529 | -0.385 | 0.203 | -0.135 |
| 3.751061628386119 | -0.385 | 0.203 | -0.135 |
| 3.754203221039708 | -0.386 | 0.203 | -0.135 |
| 3.757344813693298 | -0.386 | 0.203 | -0.135 |
| 3.760486406346887 | -0.387 | 0.203 | -0.135 |
| 3.763627999000477 | -0.387 | 0.203 | -0.135 |
| 3.766769591654067 | -0.388 | 0.203 | -0.135 |
| 3.769911184307656 | -0.388 | 0.203 | -0.135 |
| 3.773052776961246 | -0.389 | 0.203 | -0.135 |
| 3.776194369614835 | -0.389 | 0.203 | -0.135 |
| 3.779335962268425 | -0.39 | 0.203 | -0.135 |
| 3.782477554922014 | -0.39 | 0.203 | -0.135 |
| 3.785619147575604 | -0.391 | 0.203 | -0.135 |
| 3.788760740229193 | -0.391 | 0.203 | -0.135 |
| 3.791902332882783 | -0.391 | 0.203 | -0.135 |
| 3.795043925536373 | -0.392 | 0.203 | -0.135 |
| 3.798185518189962 | -0.392 | 0.203 | -0.135 |
| 3.801327110843552 | -0.392 | 0.203 | -0.135 |
| 3.804468703497142 | -0.393 | 0.203 | -0.135 |
| 3.807610296150731 | -0.393 | 0.203 | -0.135 |
| 3.810751888804321 | -0.394 | 0.203 | -0.135 |
| 3.813893481457911 | -0.394 | 0.203 | -0.135 |
| 3.8170350741115 | -0.394 | 0.203 | -0.135 |
| 3.82017666676509 | -0.395 | 0.203 | -0.135 |
| 3.823318259418679 | -0.395 | 0.203 | -0.135 |
| 3.826459852072269 | -0.395 | 0.203 | -0.135 |
| 3.829601444725859 | -0.396 | 0.203 | -0.135 |
| 3.832743037379448 | -0.396 | 0.203 | -0.135 |
| 3.835884630033038 | -0.396 | 0.203 | -0.135 |
| 3.839026222686627 | -0.396 | 0.203 | -0.135 |
| 3.842167815340217 | -0.397 | 0.203 | -0.135 |
| 3.845309407993807 | -0.397 | 0.203 | -0.135 |
| 3.848451000647396 | -0.397 | 0.203 | -0.135 |
| 3.851592593300986 | -0.398 | 0.203 | -0.135 |
| 3.854734185954575 | -0.398 | 0.203 | -0.135 |
| 3.857875778608165 | -0.398 | 0.203 | -0.135 |
| 3.861017371261755 | -0.398 | 0.203 | -0.135 |
| 3.864158963915344 | -0.399 | 0.203 | -0.135 |
| 3.867300556568933 | -0.399 | 0.203 | -0.135 |
| 3.870442149222523 | -0.399 | 0.203 | -0.135 |
| 3.873583741876112 | -0.399 | 0.203 | -0.135 |
| 3.876725334529703 | -0.399 | 0.203 | -0.135 |
| 3.879866927183292 | -0.4 | 0.203 | -0.135 |
| 3.883008519836882 | -0.4 | 0.203 | -0.135 |
| 3.886150112490471 | -0.4 | 0.203 | -0.135 |
| 3.889291705144061 | -0.4 | 0.203 | -0.135 |
| 3.892433297797651 | -0.4 | 0.203 | -0.135 |
| 3.89557489045124 | -0.401 | 0.203 | -0.135 |
| 3.89871648310483 | -0.401 | 0.203 | -0.135 |
| 3.901858075758419 | -0.401 | 0.203 | -0.135 |
| 3.904999668412009 | -0.401 | 0.203 | -0.135 |
| 3.908141261065598 | -0.401 | 0.203 | -0.135 |
| 3.911282853719188 | -0.401 | 0.203 | -0.135 |
| 3.914424446372778 | -0.402 | 0.203 | -0.135 |
| 3.917566039026367 | -0.402 | 0.203 | -0.134 |
| 3.920707631679957 | -0.402 | 0.203 | -0.134 |
| 3.923849224333547 | -0.402 | 0.203 | -0.134 |
| 3.926990816987136 | -0.402 | 0.203 | -0.134 |
| 3.930132409640726 | -0.402 | 0.203 | -0.134 |
| 3.933274002294315 | -0.403 | 0.203 | -0.134 |
| 3.936415594947905 | -0.403 | 0.203 | -0.134 |
| 3.939557187601495 | -0.403 | 0.203 | -0.133 |
| 3.942698780255084 | -0.403 | 0.203 | -0.133 |
| 3.945840372908674 | -0.403 | 0.203 | -0.133 |
| 3.948981965562263 | -0.403 | 0.203 | -0.133 |
| 3.952123558215853 | -0.403 | 0.203 | -0.133 |
| 3.955265150869442 | -0.403 | 0.203 | -0.132 |
| 3.958406743523032 | -0.403 | 0.203 | -0.132 |
| 3.961548336176622 | -0.404 | 0.203 | -0.132 |
| 3.964689928830211 | -0.404 | 0.203 | -0.131 |
| 3.967831521483801 | -0.404 | 0.203 | -0.131 |
| 3.97097311413739 | -0.404 | 0.203 | -0.131 |
| 3.97411470679098 | -0.404 | 0.203 | -0.13 |
| 3.97725629944457 | -0.404 | 0.203 | -0.13 |
| 3.98039789209816 | -0.404 | 0.203 | -0.129 |
| 3.983539484751749 | -0.404 | 0.203 | -0.129 |
| 3.986681077405338 | -0.404 | 0.203 | -0.128 |
| 3.989822670058928 | -0.404 | 0.203 | -0.128 |
| 3.992964262712517 | -0.404 | 0.203 | -0.127 |
| 3.996105855366107 | -0.404 | 0.203 | -0.127 |
| 3.999247448019697 | -0.405 | 0.203 | -0.126 |
| 4.002389040673287 | -0.405 | 0.203 | -0.125 |
| 4.005530633326877 | -0.405 | 0.203 | -0.124 |
| 4.008672225980466 | -0.405 | 0.203 | -0.124 |
| 4.011813818634056 | -0.405 | 0.203 | -0.123 |
| 4.014955411287645 | -0.405 | 0.203 | -0.122 |
| 4.018097003941234 | -0.405 | 0.203 | -0.121 |
| 4.021238596594824 | -0.405 | 0.203 | -0.12 |
| 4.024380189248414 | -0.405 | 0.203 | -0.119 |
| 4.027521781902004 | -0.405 | 0.203 | -0.118 |
| 4.030663374555593 | -0.405 | 0.203 | -0.117 |
| 4.033804967209183 | -0.405 | 0.203 | -0.116 |
| 4.036946559862773 | -0.405 | 0.203 | -0.115 |
| 4.040088152516362 | -0.405 | 0.203 | -0.114 |
| 4.043229745169951 | -0.405 | 0.203 | -0.112 |
| 4.046371337823541 | -0.405 | 0.203 | -0.111 |
| 4.049512930477131 | -0.405 | 0.203 | -0.11 |
| 4.05265452313072 | -0.405 | 0.203 | -0.108 |
| 4.05579611578431 | -0.405 | 0.203 | -0.107 |
| 4.0589377084379 | -0.406 | 0.203 | -0.105 |
| 4.062079301091489 | -0.406 | 0.203 | -0.104 |
| 4.065220893745079 | -0.406 | 0.203 | -0.102 |
| 4.068362486398668 | -0.406 | 0.203 | -0.1 |
| 4.071504079052258 | -0.406 | 0.203 | -0.099 |
| 4.074645671705848 | -0.406 | 0.203 | -0.097 |
| 4.077787264359437 | -0.406 | 0.203 | -0.095 |
| 4.080928857013027 | -0.406 | 0.203 | -0.093 |
| 4.084070449666616 | -0.406 | 0.203 | -0.091 |
| 4.087212042320206 | -0.406 | 0.203 | -0.089 |
| 4.090353634973795 | -0.406 | 0.203 | -0.087 |
| 4.093495227627385 | -0.406 | 0.203 | -0.085 |
| 4.096636820280975 | -0.406 | 0.203 | -0.083 |
| 4.099778412934564 | -0.406 | 0.203 | -0.08 |
| 4.102920005588154 | -0.406 | 0.203 | -0.078 |
| 4.106061598241744 | -0.406 | 0.203 | -0.076 |
| 4.109203190895333 | -0.406 | 0.203 | -0.073 |
| 4.112344783548923 | -0.406 | 0.203 | -0.071 |
| 4.115486376202512 | -0.406 | 0.203 | -0.068 |
| 4.118627968856102 | -0.406 | 0.203 | -0.066 |
| 4.121769561509692 | -0.406 | 0.203 | -0.063 |
| 4.124911154163281 | -0.406 | 0.203 | -0.061 |
| 4.128052746816871 | -0.406 | 0.203 | -0.058 |
| 4.13119433947046 | -0.406 | 0.203 | -0.055 |
| 4.13433593212405 | -0.406 | 0.203 | -0.052 |
| 4.13747752477764 | -0.406 | 0.203 | -0.05 |
| 4.14061911743123 | -0.406 | 0.203 | -0.047 |
| 4.143760710084818 | -0.406 | 0.203 | -0.044 |
| 4.146902302738408 | -0.406 | 0.203 | -0.041 |
| 4.150043895391998 | -0.406 | 0.203 | -0.038 |
| 4.153185488045588 | -0.406 | 0.203 | -0.035 |
| 4.156327080699177 | -0.406 | 0.203 | -0.032 |
| 4.159468673352766 | -0.406 | 0.203 | -0.029 |
| 4.162610266006356 | -0.406 | 0.203 | -0.026 |
| 4.165751858659946 | -0.406 | 0.203 | -0.023 |
| 4.168893451313535 | -0.406 | 0.203 | -0.02 |
| 4.172035043967125 | -0.406 | 0.203 | -0.017 |
| 4.175176636620715 | -0.406 | 0.203 | -0.014 |
| 4.178318229274304 | -0.406 | 0.203 | -0.01 |
| 4.181459821927894 | -0.406 | 0.203 | -0.007 |
| 4.184601414581484 | -0.406 | 0.203 | -0.004 |
| 4.187743007235073 | -0.406 | 0.203 | -0.001 |
| 4.190884599888663 | -0.406 | 0.203 | 0.002 |
| 4.194026192542252 | -0.406 | 0.203 | 0.005 |
| 4.197167785195842 | -0.406 | 0.203 | 0.008 |
| 4.200309377849432 | -0.406 | 0.203 | 0.011 |
| 4.203450970503021 | -0.406 | 0.203 | 0.015 |
| 4.206592563156611 | -0.406 | 0.203 | 0.018 |
| 4.2097341558102 | -0.406 | 0.203 | 0.021 |
| 4.21287574846379 | -0.406 | 0.203 | 0.024 |
| 4.21601734111738 | -0.406 | 0.203 | 0.027 |
| 4.21915893377097 | -0.406 | 0.203 | 0.03 |
| 4.222300526424559 | -0.406 | 0.203 | 0.033 |
| 4.225442119078148 | -0.406 | 0.203 | 0.036 |
| 4.228583711731738 | -0.406 | 0.203 | 0.039 |
| 4.231725304385327 | -0.406 | 0.203 | 0.042 |
| 4.234866897038917 | -0.406 | 0.203 | 0.045 |
| 4.238008489692506 | -0.406 | 0.203 | 0.048 |
| 4.241150082346096 | -0.406 | 0.203 | 0.05 |
| 4.244291674999685 | -0.406 | 0.203 | 0.053 |
| 4.247433267653276 | -0.406 | 0.203 | 0.056 |
| 4.250574860306865 | -0.406 | 0.203 | 0.059 |
| 4.253716452960455 | -0.406 | 0.203 | 0.061 |
| 4.256858045614044 | -0.406 | 0.203 | 0.064 |
| 4.259999638267634 | -0.406 | 0.203 | 0.067 |
| 4.263141230921224 | -0.406 | 0.203 | 0.069 |
| 4.266282823574813 | -0.406 | 0.203 | 0.072 |
| 4.269424416228403 | -0.406 | 0.203 | 0.074 |
| 4.272566008881992 | -0.406 | 0.202 | 0.076 |
| 4.275707601535582 | -0.406 | 0.202 | 0.079 |
| 4.27884919418917 | -0.406 | 0.202 | 0.081 |
| 4.28199078684276 | -0.406 | 0.202 | 0.083 |
| 4.285132379496351 | -0.406 | 0.202 | 0.085 |
| 4.28827397214994 | -0.406 | 0.202 | 0.088 |
| 4.29141556480353 | -0.406 | 0.202 | 0.09 |
| 4.294557157457119 | -0.406 | 0.202 | 0.092 |
| 4.29769875011071 | -0.406 | 0.202 | 0.094 |
| 4.300840342764299 | -0.406 | 0.202 | 0.095 |
| 4.303981935417888 | -0.406 | 0.202 | 0.097 |
| 4.307123528071478 | -0.406 | 0.202 | 0.099 |
| 4.310265120725067 | -0.406 | 0.202 | 0.101 |
| 4.313406713378657 | -0.406 | 0.201 | 0.103 |
| 4.316548306032247 | -0.406 | 0.201 | 0.104 |
| 4.319689898685836 | -0.406 | 0.201 | 0.106 |
| 4.322831491339426 | -0.406 | 0.201 | 0.107 |
| 4.325973083993015 | -0.406 | 0.201 | 0.109 |
| 4.329114676646605 | -0.406 | 0.201 | 0.11 |
| 4.332256269300195 | -0.406 | 0.2 | 0.111 |
| 4.335397861953784 | -0.406 | 0.2 | 0.113 |
| 4.338539454607374 | -0.406 | 0.2 | 0.114 |
| 4.341681047260963 | -0.406 | 0.2 | 0.115 |
| 4.344822639914553 | -0.406 | 0.2 | 0.116 |
| 4.347964232568143 | -0.406 | 0.2 | 0.117 |
| 4.351105825221732 | -0.406 | 0.199 | 0.119 |
| 4.354247417875322 | -0.406 | 0.199 | 0.12 |
| 4.357389010528911 | -0.406 | 0.199 | 0.12 |
| 4.360530603182501 | -0.406 | 0.199 | 0.121 |
| 4.36367219583609 | -0.406 | 0.198 | 0.122 |
| 4.36681378848968 | -0.406 | 0.198 | 0.123 |
| 4.36995538114327 | -0.406 | 0.198 | 0.124 |
| 4.373096973796859 | -0.406 | 0.197 | 0.125 |
| 4.376238566450449 | -0.406 | 0.197 | 0.125 |
| 4.379380159104038 | -0.406 | 0.197 | 0.126 |
| 4.382521751757628 | -0.406 | 0.196 | 0.127 |
| 4.385663344411217 | -0.406 | 0.196 | 0.127 |
| 4.388804937064807 | -0.406 | 0.195 | 0.128 |
| 4.391946529718397 | -0.406 | 0.195 | 0.128 |
| 4.395088122371987 | -0.406 | 0.195 | 0.129 |
| 4.398229715025576 | -0.406 | 0.194 | 0.129 |
| 4.401371307679165 | -0.406 | 0.194 | 0.13 |
| 4.404512900332755 | -0.406 | 0.193 | 0.13 |
| 4.407654492986345 | -0.406 | 0.193 | 0.131 |
| 4.410796085639934 | -0.406 | 0.192 | 0.131 |
| 4.413937678293524 | -0.406 | 0.192 | 0.131 |
| 4.417079270947114 | -0.406 | 0.191 | 0.132 |
| 4.420220863600703 | -0.406 | 0.19 | 0.132 |
| 4.423362456254293 | -0.406 | 0.19 | 0.132 |
| 4.426504048907883 | -0.406 | 0.189 | 0.133 |
| 4.429645641561472 | -0.406 | 0.188 | 0.133 |
| 4.432787234215062 | -0.406 | 0.188 | 0.133 |
| 4.435928826868651 | -0.406 | 0.187 | 0.133 |
| 4.43907041952224 | -0.406 | 0.186 | 0.133 |
| 4.44221201217583 | -0.406 | 0.185 | 0.134 |
| 4.44535360482942 | -0.406 | 0.185 | 0.134 |
| 4.44849519748301 | -0.406 | 0.184 | 0.134 |
| 4.4516367901366 | -0.406 | 0.183 | 0.134 |
| 4.454778382790188 | -0.406 | 0.182 | 0.134 |
| 4.457919975443779 | -0.406 | 0.181 | 0.134 |
| 4.461061568097368 | -0.406 | 0.18 | 0.134 |
| 4.464203160750958 | -0.406 | 0.179 | 0.135 |
| 4.467344753404547 | -0.406 | 0.178 | 0.135 |
| 4.470486346058137 | -0.406 | 0.177 | 0.135 |
| 4.473627938711726 | -0.406 | 0.176 | 0.135 |
| 4.476769531365316 | -0.406 | 0.175 | 0.135 |
| 4.479911124018905 | -0.406 | 0.174 | 0.135 |
| 4.483052716672495 | -0.406 | 0.173 | 0.135 |
| 4.486194309326085 | -0.406 | 0.172 | 0.135 |
| 4.489335901979674 | -0.406 | 0.17 | 0.135 |
| 4.492477494633264 | -0.406 | 0.169 | 0.135 |
| 4.495619087286854 | -0.406 | 0.168 | 0.135 |
| 4.498760679940443 | -0.406 | 0.167 | 0.135 |
| 4.501902272594033 | -0.406 | 0.165 | 0.135 |
| 4.505043865247622 | -0.406 | 0.164 | 0.135 |
| 4.508185457901212 | -0.406 | 0.162 | 0.135 |
| 4.511327050554801 | -0.406 | 0.161 | 0.135 |
| 4.514468643208391 | -0.406 | 0.159 | 0.135 |
| 4.517610235861981 | -0.406 | 0.158 | 0.135 |
| 4.520751828515571 | -0.406 | 0.156 | 0.135 |
| 4.52389342116916 | -0.406 | 0.155 | 0.135 |
| 4.52703501382275 | -0.406 | 0.153 | 0.135 |
| 4.530176606476339 | -0.406 | 0.151 | 0.135 |
| 4.533318199129928 | -0.406 | 0.15 | 0.135 |
| 4.536459791783518 | -0.406 | 0.148 | 0.135 |
| 4.539601384437108 | -0.406 | 0.146 | 0.135 |
| 4.542742977090698 | -0.406 | 0.144 | 0.135 |
| 4.545884569744287 | -0.406 | 0.142 | 0.135 |
| 4.549026162397876 | -0.406 | 0.14 | 0.135 |
| 4.552167755051466 | -0.406 | 0.138 | 0.135 |
| 4.555309347705056 | -0.406 | 0.136 | 0.135 |
| 4.558450940358646 | -0.406 | 0.134 | 0.135 |
| 4.561592533012235 | -0.406 | 0.132 | 0.135 |
| 4.564734125665825 | -0.406 | 0.13 | 0.135 |
| 4.567875718319415 | -0.406 | 0.128 | 0.135 |
| 4.571017310973004 | -0.406 | 0.126 | 0.135 |
| 4.574158903626594 | -0.406 | 0.124 | 0.135 |
| 4.577300496280183 | -0.406 | 0.122 | 0.135 |
| 4.580442088933772 | -0.406 | 0.119 | 0.135 |
| 4.583583681587362 | -0.406 | 0.117 | 0.135 |
| 4.586725274240952 | -0.406 | 0.115 | 0.135 |
| 4.589866866894542 | -0.406 | 0.112 | 0.135 |
| 4.593008459548131 | -0.406 | 0.11 | 0.135 |
| 4.596150052201721 | -0.406 | 0.107 | 0.135 |
| 4.59929164485531 | -0.406 | 0.105 | 0.135 |
| 4.6024332375089 | -0.406 | 0.102 | 0.135 |
| 4.60557483016249 | -0.406 | 0.1 | 0.135 |
| 4.608716422816079 | -0.406 | 0.097 | 0.135 |
| 4.611858015469668 | -0.406 | 0.095 | 0.135 |
| 4.614999608123258 | -0.406 | 0.092 | 0.135 |
| 4.618141200776848 | -0.406 | 0.089 | 0.135 |
| 4.621282793430437 | -0.406 | 0.087 | 0.135 |
| 4.624424386084027 | -0.406 | 0.084 | 0.135 |
| 4.627565978737617 | -0.406 | 0.081 | 0.135 |
| 4.630707571391206 | -0.406 | 0.079 | 0.135 |
| 4.633849164044795 | -0.406 | 0.076 | 0.135 |
| 4.636990756698386 | -0.406 | 0.073 | 0.135 |
| 4.640132349351975 | -0.406 | 0.07 | 0.135 |
| 4.643273942005564 | -0.406 | 0.067 | 0.135 |
| 4.646415534659154 | -0.406 | 0.064 | 0.135 |
| 4.649557127312744 | -0.406 | 0.061 | 0.135 |
| 4.652698719966334 | -0.406 | 0.058 | 0.135 |
| 4.655840312619923 | -0.406 | 0.055 | 0.135 |
| 4.658981905273513 | -0.406 | 0.053 | 0.135 |
| 4.662123497927102 | -0.406 | 0.05 | 0.135 |
| 4.665265090580692 | -0.406 | 0.047 | 0.135 |
| 4.668406683234282 | -0.406 | 0.043 | 0.135 |
| 4.671548275887871 | -0.406 | 0.04 | 0.135 |
| 4.674689868541461 | -0.406 | 0.037 | 0.135 |
| 4.67783146119505 | -0.406 | 0.034 | 0.135 |
| 4.68097305384864 | -0.406 | 0.031 | 0.135 |
| 4.68411464650223 | -0.406 | 0.028 | 0.135 |
| 4.687256239155819 | -0.406 | 0.025 | 0.135 |
| 4.690397831809409 | -0.406 | 0.022 | 0.135 |
| 4.693539424462998 | -0.406 | 0.019 | 0.135 |
| 4.696681017116588 | -0.406 | 0.016 | 0.135 |
| 4.699822609770177 | -0.406 | 0.013 | 0.135 |
| 4.702964202423767 | -0.406 | 0.009 | 0.135 |
| 4.706105795077356 | -0.406 | 0.006 | 0.135 |
| 4.709247387730946 | -0.406 | 0.003 | 0.135 |
| 4.712388980384535 | -0.406 | 0 | 0.135 |
| 4.715530573038126 | -0.406 | -0.003 | 0.135 |
| 4.718672165691715 | -0.406 | -0.006 | 0.135 |
| 4.721813758345305 | -0.406 | -0.009 | 0.135 |
| 4.724955350998894 | -0.406 | -0.013 | 0.135 |
| 4.728096943652484 | -0.406 | -0.016 | 0.135 |
| 4.731238536306074 | -0.406 | -0.019 | 0.135 |
| 4.734380128959663 | -0.406 | -0.022 | 0.135 |
| 4.737521721613253 | -0.406 | -0.025 | 0.135 |
| 4.740663314266842 | -0.406 | -0.028 | 0.135 |
| 4.743804906920432 | -0.406 | -0.031 | 0.135 |
| 4.74694649957402 | -0.406 | -0.034 | 0.135 |
| 4.750088092227611 | -0.406 | -0.037 | 0.135 |
| 4.7532296848812 | -0.406 | -0.04 | 0.135 |
| 4.75637127753479 | -0.406 | -0.043 | 0.135 |
| 4.75951287018838 | -0.406 | -0.047 | 0.135 |
| 4.76265446284197 | -0.406 | -0.05 | 0.135 |
| 4.765796055495559 | -0.406 | -0.053 | 0.135 |
| 4.768937648149149 | -0.406 | -0.055 | 0.135 |
| 4.772079240802738 | -0.406 | -0.058 | 0.135 |
| 4.775220833456327 | -0.406 | -0.061 | 0.135 |
| 4.778362426109917 | -0.406 | -0.064 | 0.135 |
| 4.781504018763507 | -0.406 | -0.067 | 0.135 |
| 4.784645611417097 | -0.406 | -0.07 | 0.135 |
| 4.787787204070686 | -0.406 | -0.073 | 0.135 |
| 4.790928796724275 | -0.406 | -0.076 | 0.135 |
| 4.794070389377865 | -0.406 | -0.079 | 0.135 |
| 4.797211982031455 | -0.406 | -0.081 | 0.135 |
| 4.800353574685045 | -0.406 | -0.084 | 0.135 |
| 4.803495167338634 | -0.406 | -0.087 | 0.135 |
| 4.806636759992224 | -0.406 | -0.089 | 0.135 |
| 4.809778352645814 | -0.406 | -0.092 | 0.135 |
| 4.812919945299403 | -0.406 | -0.095 | 0.135 |
| 4.816061537952993 | -0.406 | -0.097 | 0.135 |
| 4.819203130606582 | -0.406 | -0.1 | 0.135 |
| 4.822344723260172 | -0.406 | -0.102 | 0.135 |
| 4.825486315913761 | -0.406 | -0.105 | 0.135 |
| 4.828627908567351 | -0.406 | -0.107 | 0.135 |
| 4.83176950122094 | -0.406 | -0.11 | 0.135 |
| 4.83491109387453 | -0.406 | -0.112 | 0.135 |
| 4.83805268652812 | -0.406 | -0.115 | 0.135 |
| 4.841194279181709 | -0.406 | -0.117 | 0.135 |
| 4.844335871835299 | -0.406 | -0.119 | 0.135 |
| 4.847477464488889 | -0.406 | -0.122 | 0.135 |
| 4.850619057142478 | -0.406 | -0.124 | 0.135 |
| 4.853760649796068 | -0.406 | -0.126 | 0.135 |
| 4.856902242449657 | -0.406 | -0.128 | 0.135 |
| 4.860043835103247 | -0.406 | -0.13 | 0.135 |
| 4.863185427756837 | -0.406 | -0.132 | 0.135 |
| 4.866327020410426 | -0.406 | -0.134 | 0.135 |
| 4.869468613064015 | -0.406 | -0.136 | 0.135 |
| 4.872610205717605 | -0.406 | -0.138 | 0.135 |
| 4.875751798371195 | -0.406 | -0.14 | 0.135 |
| 4.878893391024784 | -0.406 | -0.142 | 0.135 |
| 4.882034983678374 | -0.406 | -0.144 | 0.135 |
| 4.885176576331964 | -0.406 | -0.146 | 0.135 |
| 4.888318168985553 | -0.406 | -0.148 | 0.135 |
| 4.891459761639143 | -0.406 | -0.15 | 0.135 |
| 4.894601354292733 | -0.406 | -0.151 | 0.135 |
| 4.897742946946322 | -0.406 | -0.153 | 0.135 |
| 4.900884539599912 | -0.406 | -0.155 | 0.135 |
| 4.904026132253501 | -0.406 | -0.156 | 0.135 |
| 4.907167724907091 | -0.406 | -0.158 | 0.135 |
| 4.91030931756068 | -0.406 | -0.159 | 0.135 |
| 4.91345091021427 | -0.406 | -0.161 | 0.135 |
| 4.91659250286786 | -0.406 | -0.162 | 0.135 |
| 4.91973409552145 | -0.406 | -0.164 | 0.135 |
| 4.922875688175039 | -0.406 | -0.165 | 0.135 |
| 4.926017280828628 | -0.406 | -0.167 | 0.135 |
| 4.929158873482218 | -0.406 | -0.168 | 0.135 |
| 4.932300466135808 | -0.406 | -0.169 | 0.135 |
| 4.935442058789397 | -0.406 | -0.17 | 0.135 |
| 4.938583651442987 | -0.406 | -0.172 | 0.135 |
| 4.941725244096576 | -0.406 | -0.173 | 0.135 |
| 4.944866836750166 | -0.406 | -0.174 | 0.135 |
| 4.948008429403755 | -0.406 | -0.175 | 0.135 |
| 4.951150022057345 | -0.406 | -0.176 | 0.135 |
| 4.954291614710935 | -0.406 | -0.177 | 0.135 |
| 4.957433207364524 | -0.406 | -0.178 | 0.135 |
| 4.960574800018114 | -0.406 | -0.179 | 0.135 |
| 4.963716392671704 | -0.406 | -0.18 | 0.134 |
| 4.966857985325293 | -0.406 | -0.181 | 0.134 |
| 4.969999577978883 | -0.406 | -0.182 | 0.134 |
| 4.973141170632472 | -0.406 | -0.183 | 0.134 |
| 4.976282763286062 | -0.406 | -0.184 | 0.134 |
| 4.979424355939651 | -0.406 | -0.185 | 0.134 |
| 4.982565948593241 | -0.406 | -0.185 | 0.134 |
| 4.985707541246831 | -0.406 | -0.186 | 0.133 |
| 4.98884913390042 | -0.406 | -0.187 | 0.133 |
| 4.99199072655401 | -0.406 | -0.188 | 0.133 |
| 4.9951323192076 | -0.406 | -0.188 | 0.133 |
| 4.99827391186119 | -0.406 | -0.189 | 0.133 |
| 5.00141550451478 | -0.406 | -0.19 | 0.132 |
| 5.004557097168369 | -0.406 | -0.19 | 0.132 |
| 5.007698689821958 | -0.406 | -0.191 | 0.132 |
| 5.010840282475548 | -0.406 | -0.192 | 0.131 |
| 5.013981875129137 | -0.406 | -0.192 | 0.131 |
| 5.017123467782727 | -0.406 | -0.193 | 0.131 |
| 5.020265060436317 | -0.406 | -0.193 | 0.13 |
| 5.023406653089906 | -0.406 | -0.194 | 0.13 |
| 5.026548245743496 | -0.406 | -0.194 | 0.129 |
| 5.029689838397085 | -0.406 | -0.195 | 0.129 |
| 5.032831431050674 | -0.406 | -0.195 | 0.128 |
| 5.035973023704264 | -0.406 | -0.195 | 0.128 |
| 5.039114616357854 | -0.406 | -0.196 | 0.127 |
| 5.042256209011444 | -0.406 | -0.196 | 0.127 |
| 5.045397801665033 | -0.406 | -0.197 | 0.126 |
| 5.048539394318622 | -0.406 | -0.197 | 0.125 |
| 5.051680986972213 | -0.406 | -0.197 | 0.125 |
| 5.054822579625802 | -0.406 | -0.198 | 0.124 |
| 5.057964172279392 | -0.406 | -0.198 | 0.123 |
| 5.061105764932981 | -0.406 | -0.198 | 0.122 |
| 5.064247357586571 | -0.406 | -0.199 | 0.121 |
| 5.067388950240161 | -0.406 | -0.199 | 0.12 |
| 5.07053054289375 | -0.406 | -0.199 | 0.12 |
| 5.07367213554734 | -0.406 | -0.199 | 0.119 |
| 5.07681372820093 | -0.406 | -0.2 | 0.117 |
| 5.079955320854519 | -0.406 | -0.2 | 0.116 |
| 5.083096913508108 | -0.406 | -0.2 | 0.115 |
| 5.086238506161698 | -0.406 | -0.2 | 0.114 |
| 5.089380098815288 | -0.406 | -0.2 | 0.113 |
| 5.092521691468877 | -0.406 | -0.2 | 0.111 |
| 5.095663284122466 | -0.406 | -0.201 | 0.11 |
| 5.098804876776057 | -0.406 | -0.201 | 0.109 |
| 5.101946469429646 | -0.406 | -0.201 | 0.107 |
| 5.105088062083236 | -0.406 | -0.201 | 0.106 |
| 5.108229654736825 | -0.406 | -0.201 | 0.104 |
| 5.111371247390415 | -0.406 | -0.201 | 0.103 |
| 5.114512840044005 | -0.406 | -0.202 | 0.101 |
| 5.117654432697594 | -0.406 | -0.202 | 0.099 |
| 5.120796025351184 | -0.406 | -0.202 | 0.097 |
| 5.123937618004773 | -0.406 | -0.202 | 0.095 |
| 5.127079210658363 | -0.406 | -0.202 | 0.094 |
| 5.130220803311953 | -0.406 | -0.202 | 0.092 |
| 5.133362395965542 | -0.406 | -0.202 | 0.09 |
| 5.136503988619131 | -0.406 | -0.202 | 0.088 |
| 5.13964558127272 | -0.406 | -0.202 | 0.085 |
| 5.142787173926311 | -0.406 | -0.202 | 0.083 |
| 5.1459287665799 | -0.406 | -0.202 | 0.081 |
| 5.14907035923349 | -0.406 | -0.202 | 0.079 |
| 5.15221195188708 | -0.406 | -0.202 | 0.076 |
| 5.15535354454067 | -0.406 | -0.203 | 0.074 |
| 5.158495137194259 | -0.406 | -0.203 | 0.072 |
| 5.161636729847848 | -0.406 | -0.203 | 0.069 |
| 5.164778322501438 | -0.406 | -0.203 | 0.067 |
| 5.167919915155028 | -0.406 | -0.203 | 0.064 |
| 5.171061507808617 | -0.406 | -0.203 | 0.061 |
| 5.174203100462206 | -0.406 | -0.203 | 0.059 |
| 5.177344693115796 | -0.406 | -0.203 | 0.056 |
| 5.180486285769386 | -0.406 | -0.203 | 0.053 |
| 5.183627878422976 | -0.406 | -0.203 | 0.05 |
| 5.186769471076565 | -0.406 | -0.203 | 0.048 |
| 5.189911063730155 | -0.406 | -0.203 | 0.045 |
| 5.193052656383744 | -0.406 | -0.203 | 0.042 |
| 5.196194249037334 | -0.406 | -0.203 | 0.039 |
| 5.199335841690924 | -0.406 | -0.203 | 0.036 |
| 5.202477434344513 | -0.406 | -0.203 | 0.033 |
| 5.205619026998103 | -0.406 | -0.203 | 0.03 |
| 5.208760619651692 | -0.406 | -0.203 | 0.027 |
| 5.211902212305282 | -0.406 | -0.203 | 0.024 |
| 5.215043804958871 | -0.406 | -0.203 | 0.021 |
| 5.218185397612461 | -0.406 | -0.203 | 0.018 |
| 5.221326990266051 | -0.406 | -0.203 | 0.015 |
| 5.22446858291964 | -0.406 | -0.203 | 0.011 |
| 5.22761017557323 | -0.406 | -0.203 | 0.008 |
| 5.23075176822682 | -0.406 | -0.203 | 0.005 |
| 5.23389336088041 | -0.406 | -0.203 | 0.002 |
| 5.237034953533999 | -0.406 | -0.203 | -0.001 |
| 5.240176546187588 | -0.406 | -0.203 | -0.004 |
| 5.243318138841178 | -0.406 | -0.203 | -0.007 |
| 5.246459731494767 | -0.406 | -0.203 | -0.01 |
| 5.249601324148357 | -0.406 | -0.203 | -0.014 |
| 5.252742916801947 | -0.406 | -0.203 | -0.017 |
| 5.255884509455536 | -0.406 | -0.203 | -0.02 |
| 5.259026102109125 | -0.406 | -0.203 | -0.023 |
| 5.262167694762715 | -0.406 | -0.203 | -0.026 |
| 5.265309287416305 | -0.406 | -0.203 | -0.029 |
| 5.268450880069895 | -0.406 | -0.203 | -0.032 |
| 5.271592472723484 | -0.406 | -0.203 | -0.035 |
| 5.274734065377074 | -0.406 | -0.203 | -0.038 |
| 5.277875658030664 | -0.406 | -0.203 | -0.041 |
| 5.281017250684253 | -0.406 | -0.203 | -0.044 |
| 5.284158843337843 | -0.406 | -0.203 | -0.047 |
| 5.287300435991432 | -0.406 | -0.203 | -0.05 |
| 5.290442028645022 | -0.406 | -0.203 | -0.052 |
| 5.293583621298612 | -0.406 | -0.203 | -0.055 |
| 5.296725213952201 | -0.406 | -0.203 | -0.058 |
| 5.299866806605791 | -0.406 | -0.203 | -0.061 |
| 5.30300839925938 | -0.406 | -0.203 | -0.063 |
| 5.30614999191297 | -0.406 | -0.203 | -0.066 |
| 5.30929158456656 | -0.406 | -0.203 | -0.068 |
| 5.312433177220149 | -0.406 | -0.203 | -0.071 |
| 5.315574769873739 | -0.406 | -0.203 | -0.073 |
| 5.318716362527328 | -0.406 | -0.203 | -0.076 |
| 5.321857955180918 | -0.406 | -0.203 | -0.078 |
| 5.324999547834508 | -0.406 | -0.203 | -0.08 |
| 5.328141140488097 | -0.406 | -0.203 | -0.083 |
| 5.331282733141686 | -0.406 | -0.203 | -0.085 |
| 5.334424325795276 | -0.406 | -0.203 | -0.087 |
| 5.337565918448866 | -0.406 | -0.203 | -0.089 |
| 5.340707511102456 | -0.406 | -0.203 | -0.091 |
| 5.343849103756045 | -0.406 | -0.203 | -0.093 |
| 5.346990696409634 | -0.406 | -0.203 | -0.095 |
| 5.350132289063224 | -0.406 | -0.203 | -0.097 |
| 5.353273881716814 | -0.406 | -0.203 | -0.099 |
| 5.356415474370403 | -0.406 | -0.203 | -0.1 |
| 5.359557067023993 | -0.406 | -0.203 | -0.102 |
| 5.362698659677583 | -0.406 | -0.203 | -0.104 |
| 5.365840252331172 | -0.406 | -0.203 | -0.105 |
| 5.368981844984762 | -0.405 | -0.203 | -0.107 |
| 5.372123437638351 | -0.405 | -0.203 | -0.108 |
| 5.375265030291941 | -0.405 | -0.203 | -0.11 |
| 5.378406622945531 | -0.405 | -0.203 | -0.111 |
| 5.38154821559912 | -0.405 | -0.203 | -0.112 |
| 5.38468980825271 | -0.405 | -0.203 | -0.114 |
| 5.387831400906299 | -0.405 | -0.203 | -0.115 |
| 5.39097299355989 | -0.405 | -0.203 | -0.116 |
| 5.394114586213479 | -0.405 | -0.203 | -0.117 |
| 5.397256178867068 | -0.405 | -0.203 | -0.118 |
| 5.400397771520657 | -0.405 | -0.203 | -0.119 |
| 5.403539364174247 | -0.405 | -0.203 | -0.12 |
| 5.406680956827837 | -0.405 | -0.203 | -0.121 |
| 5.409822549481426 | -0.405 | -0.203 | -0.122 |
| 5.412964142135016 | -0.405 | -0.203 | -0.123 |
| 5.416105734788605 | -0.405 | -0.203 | -0.124 |
| 5.419247327442195 | -0.405 | -0.203 | -0.124 |
| 5.422388920095785 | -0.405 | -0.203 | -0.125 |
| 5.425530512749375 | -0.405 | -0.203 | -0.126 |
| 5.428672105402964 | -0.404 | -0.203 | -0.127 |
| 5.431813698056554 | -0.404 | -0.203 | -0.127 |
| 5.434955290710143 | -0.404 | -0.203 | -0.128 |
| 5.438096883363733 | -0.404 | -0.203 | -0.128 |
| 5.441238476017322 | -0.404 | -0.203 | -0.129 |
| 5.444380068670912 | -0.404 | -0.203 | -0.129 |
| 5.447521661324502 | -0.404 | -0.203 | -0.13 |
| 5.450663253978091 | -0.404 | -0.203 | -0.13 |
| 5.453804846631681 | -0.404 | -0.203 | -0.131 |
| 5.456946439285271 | -0.404 | -0.203 | -0.131 |
| 5.46008803193886 | -0.404 | -0.203 | -0.131 |
| 5.46322962459245 | -0.404 | -0.203 | -0.132 |
| 5.466371217246039 | -0.403 | -0.203 | -0.132 |
| 5.46951280989963 | -0.403 | -0.203 | -0.132 |
| 5.472654402553218 | -0.403 | -0.203 | -0.133 |
| 5.475795995206808 | -0.403 | -0.203 | -0.133 |
| 5.478937587860398 | -0.403 | -0.203 | -0.133 |
| 5.482079180513987 | -0.403 | -0.203 | -0.133 |
| 5.485220773167577 | -0.403 | -0.203 | -0.133 |
| 5.488362365821166 | -0.403 | -0.203 | -0.134 |
| 5.491503958474756 | -0.403 | -0.203 | -0.134 |
| 5.494645551128346 | -0.402 | -0.203 | -0.134 |
| 5.497787143781935 | -0.402 | -0.203 | -0.134 |
| 5.500928736435525 | -0.402 | -0.203 | -0.134 |
| 5.504070329089115 | -0.402 | -0.203 | -0.134 |
| 5.507211921742704 | -0.402 | -0.203 | -0.134 |
| 5.510353514396294 | -0.402 | -0.203 | -0.135 |
| 5.513495107049883 | -0.401 | -0.203 | -0.135 |
| 5.516636699703473 | -0.401 | -0.203 | -0.135 |
| 5.519778292357062 | -0.401 | -0.203 | -0.135 |
| 5.522919885010652 | -0.401 | -0.203 | -0.135 |
| 5.526061477664242 | -0.401 | -0.203 | -0.135 |
| 5.529203070317831 | -0.401 | -0.203 | -0.135 |
| 5.532344662971421 | -0.4 | -0.203 | -0.135 |
| 5.535486255625011 | -0.4 | -0.203 | -0.135 |
| 5.5386278482786 | -0.4 | -0.203 | -0.135 |
| 5.54176944093219 | -0.4 | -0.203 | -0.135 |
| 5.544911033585779 | -0.4 | -0.203 | -0.135 |
| 5.54805262623937 | -0.399 | -0.203 | -0.135 |
| 5.551194218892959 | -0.399 | -0.203 | -0.135 |
| 5.554335811546548 | -0.399 | -0.203 | -0.135 |
| 5.557477404200137 | -0.399 | -0.203 | -0.135 |
| 5.560618996853727 | -0.399 | -0.203 | -0.135 |
| 5.563760589507317 | -0.398 | -0.203 | -0.135 |
| 5.566902182160906 | -0.398 | -0.203 | -0.135 |
| 5.570043774814496 | -0.398 | -0.203 | -0.135 |
| 5.573185367468086 | -0.398 | -0.203 | -0.135 |
| 5.576326960121675 | -0.397 | -0.203 | -0.135 |
| 5.579468552775264 | -0.397 | -0.203 | -0.135 |
| 5.582610145428854 | -0.397 | -0.203 | -0.135 |
| 5.585751738082444 | -0.396 | -0.203 | -0.135 |
| 5.588893330736034 | -0.396 | -0.203 | -0.135 |
| 5.592034923389623 | -0.396 | -0.203 | -0.135 |
| 5.595176516043213 | -0.396 | -0.203 | -0.135 |
| 5.598318108696803 | -0.395 | -0.203 | -0.135 |
| 5.601459701350392 | -0.395 | -0.203 | -0.135 |
| 5.604601294003982 | -0.395 | -0.203 | -0.135 |
| 5.607742886657571 | -0.394 | -0.203 | -0.135 |
| 5.610884479311161 | -0.394 | -0.203 | -0.135 |
| 5.61402607196475 | -0.394 | -0.203 | -0.135 |
| 5.61716766461834 | -0.393 | -0.203 | -0.135 |
| 5.62030925727193 | -0.393 | -0.203 | -0.135 |
| 5.623450849925519 | -0.392 | -0.203 | -0.135 |
| 5.626592442579109 | -0.392 | -0.203 | -0.135 |
| 5.629734035232698 | -0.392 | -0.203 | -0.135 |
| 5.632875627886288 | -0.391 | -0.203 | -0.135 |
| 5.636017220539878 | -0.391 | -0.203 | -0.135 |
| 5.639158813193467 | -0.391 | -0.203 | -0.135 |
| 5.642300405847057 | -0.39 | -0.203 | -0.135 |
| 5.645441998500646 | -0.39 | -0.203 | -0.135 |
| 5.648583591154236 | -0.389 | -0.203 | -0.135 |
| 5.651725183807825 | -0.389 | -0.203 | -0.135 |
| 5.654866776461415 | -0.388 | -0.203 | -0.135 |
| 5.658008369115005 | -0.388 | -0.203 | -0.135 |
| 5.661149961768594 | -0.387 | -0.203 | -0.135 |
| 5.664291554422184 | -0.387 | -0.203 | -0.135 |
| 5.667433147075774 | -0.386 | -0.203 | -0.135 |
| 5.670574739729363 | -0.386 | -0.203 | -0.135 |
| 5.673716332382953 | -0.385 | -0.203 | -0.135 |
| 5.676857925036542 | -0.385 | -0.203 | -0.135 |
| 5.679999517690132 | -0.384 | -0.203 | -0.135 |
| 5.683141110343721 | -0.384 | -0.203 | -0.135 |
| 5.686282702997311 | -0.383 | -0.203 | -0.135 |
| 5.689424295650901 | -0.383 | -0.203 | -0.135 |
| 5.69256588830449 | -0.382 | -0.203 | -0.135 |
| 5.69570748095808 | -0.381 | -0.203 | -0.135 |
| 5.69884907361167 | -0.381 | -0.203 | -0.135 |
| 5.701990666265259 | -0.38 | -0.203 | -0.135 |
| 5.705132258918849 | -0.38 | -0.203 | -0.135 |
| 5.708273851572438 | -0.379 | -0.203 | -0.135 |
| 5.711415444226028 | -0.378 | -0.203 | -0.135 |
| 5.714557036879618 | -0.378 | -0.203 | -0.135 |
| 5.717698629533207 | -0.377 | -0.203 | -0.135 |
| 5.720840222186797 | -0.376 | -0.203 | -0.135 |
| 5.723981814840386 | -0.375 | -0.203 | -0.135 |
| 5.727123407493976 | -0.375 | -0.203 | -0.135 |
| 5.730265000147565 | -0.374 | -0.203 | -0.135 |
| 5.733406592801155 | -0.373 | -0.203 | -0.135 |
| 5.736548185454744 | -0.373 | -0.203 | -0.135 |
| 5.739689778108334 | -0.372 | -0.203 | -0.135 |
| 5.742831370761924 | -0.371 | -0.203 | -0.135 |
| 5.745972963415514 | -0.37 | -0.203 | -0.135 |
| 5.749114556069103 | -0.369 | -0.203 | -0.135 |
| 5.752256148722693 | -0.369 | -0.203 | -0.135 |
| 5.755397741376282 | -0.368 | -0.203 | -0.135 |
| 5.758539334029872 | -0.367 | -0.203 | -0.135 |
| 5.761680926683462 | -0.366 | -0.203 | -0.135 |
| 5.764822519337051 | -0.365 | -0.203 | -0.135 |
| 5.767964111990641 | -0.364 | -0.203 | -0.135 |
| 5.77110570464423 | -0.363 | -0.203 | -0.135 |
| 5.77424729729782 | -0.362 | -0.203 | -0.135 |
| 5.77738888995141 | -0.361 | -0.203 | -0.135 |
| 5.780530482605 | -0.361 | -0.203 | -0.135 |
| 5.783672075258588 | -0.36 | -0.203 | -0.135 |
| 5.786813667912178 | -0.359 | -0.203 | -0.135 |
| 5.789955260565768 | -0.358 | -0.203 | -0.135 |
| 5.793096853219358 | -0.357 | -0.203 | -0.135 |
| 5.796238445872947 | -0.356 | -0.203 | -0.135 |
| 5.799380038526537 | -0.355 | -0.203 | -0.135 |
| 5.802521631180126 | -0.353 | -0.203 | -0.135 |
| 5.805663223833715 | -0.352 | -0.203 | -0.135 |
| 5.808804816487306 | -0.351 | -0.203 | -0.135 |
| 5.811946409140895 | -0.35 | -0.203 | -0.135 |
| 5.815088001794485 | -0.349 | -0.203 | -0.135 |
| 5.818229594448074 | -0.348 | -0.203 | -0.135 |
| 5.821371187101663 | -0.347 | -0.203 | -0.135 |
| 5.824512779755254 | -0.346 | -0.203 | -0.135 |
| 5.827654372408843 | -0.344 | -0.203 | -0.135 |
| 5.830795965062433 | -0.343 | -0.203 | -0.135 |
| 5.833937557716022 | -0.342 | -0.203 | -0.135 |
| 5.837079150369612 | -0.341 | -0.203 | -0.135 |
| 5.840220743023201 | -0.34 | -0.203 | -0.135 |
| 5.843362335676791 | -0.338 | -0.202 | -0.135 |
| 5.846503928330381 | -0.337 | -0.202 | -0.135 |
| 5.84964552098397 | -0.336 | -0.202 | -0.135 |
| 5.85278711363756 | -0.334 | -0.202 | -0.135 |
| 5.85592870629115 | -0.333 | -0.202 | -0.135 |
| 5.85907029894474 | -0.332 | -0.202 | -0.135 |
| 5.862211891598329 | -0.33 | -0.202 | -0.135 |
| 5.865353484251918 | -0.329 | -0.202 | -0.135 |
| 5.868495076905508 | -0.327 | -0.202 | -0.135 |
| 5.871636669559098 | -0.326 | -0.202 | -0.135 |
| 5.874778262212687 | -0.325 | -0.202 | -0.135 |
| 5.877919854866277 | -0.323 | -0.202 | -0.135 |
| 5.881061447519866 | -0.322 | -0.202 | -0.135 |
| 5.884203040173456 | -0.32 | -0.201 | -0.135 |
| 5.887344632827046 | -0.319 | -0.201 | -0.135 |
| 5.890486225480635 | -0.317 | -0.201 | -0.135 |
| 5.893627818134224 | -0.316 | -0.201 | -0.135 |
| 5.896769410787814 | -0.314 | -0.201 | -0.135 |
| 5.899911003441404 | -0.312 | -0.201 | -0.135 |
| 5.903052596094994 | -0.311 | -0.2 | -0.135 |
| 5.906194188748583 | -0.309 | -0.2 | -0.135 |
| 5.909335781402172 | -0.308 | -0.2 | -0.135 |
| 5.912477374055762 | -0.306 | -0.2 | -0.135 |
| 5.915618966709352 | -0.304 | -0.2 | -0.135 |
| 5.918760559362942 | -0.303 | -0.2 | -0.135 |
| 5.921902152016531 | -0.301 | -0.199 | -0.135 |
| 5.92504374467012 | -0.299 | -0.199 | -0.135 |
| 5.92818533732371 | -0.297 | -0.199 | -0.135 |
| 5.9313269299773 | -0.296 | -0.199 | -0.135 |
| 5.93446852263089 | -0.294 | -0.198 | -0.135 |
| 5.93761011528448 | -0.292 | -0.198 | -0.135 |
| 5.940751707938068 | -0.29 | -0.198 | -0.135 |
| 5.943893300591658 | -0.288 | -0.197 | -0.135 |
| 5.947034893245248 | -0.286 | -0.197 | -0.135 |
| 5.950176485898837 | -0.285 | -0.197 | -0.135 |
| 5.953318078552427 | -0.283 | -0.196 | -0.135 |
| 5.956459671206017 | -0.281 | -0.196 | -0.135 |
| 5.959601263859606 | -0.279 | -0.195 | -0.135 |
| 5.962742856513196 | -0.277 | -0.195 | -0.135 |
| 5.965884449166785 | -0.275 | -0.195 | -0.135 |
| 5.969026041820375 | -0.273 | -0.194 | -0.135 |
| 5.972167634473964 | -0.271 | -0.194 | -0.135 |
| 5.975309227127554 | -0.269 | -0.193 | -0.135 |
| 5.978450819781144 | -0.267 | -0.193 | -0.135 |
| 5.981592412434733 | -0.265 | -0.192 | -0.135 |
| 5.984734005088323 | -0.263 | -0.192 | -0.135 |
| 5.987875597741913 | -0.261 | -0.191 | -0.135 |
| 5.991017190395502 | -0.258 | -0.19 | -0.135 |
| 5.994158783049092 | -0.256 | -0.19 | -0.135 |
| 5.997300375702681 | -0.254 | -0.189 | -0.135 |
| 6.000441968356271 | -0.252 | -0.188 | -0.135 |
| 6.003583561009861 | -0.25 | -0.188 | -0.135 |
| 6.00672515366345 | -0.248 | -0.187 | -0.135 |
| 6.00986674631704 | -0.245 | -0.186 | -0.135 |
| 6.01300833897063 | -0.243 | -0.185 | -0.134 |
| 6.01614993162422 | -0.241 | -0.185 | -0.134 |
| 6.019291524277808 | -0.239 | -0.184 | -0.134 |
| 6.022433116931398 | -0.236 | -0.183 | -0.134 |
| 6.025574709584988 | -0.234 | -0.182 | -0.134 |
| 6.028716302238577 | -0.232 | -0.181 | -0.134 |
| 6.031857894892167 | -0.229 | -0.18 | -0.134 |
| 6.034999487545757 | -0.227 | -0.179 | -0.133 |
| 6.038141080199346 | -0.225 | -0.178 | -0.133 |
| 6.041282672852935 | -0.222 | -0.177 | -0.133 |
| 6.044424265506525 | -0.22 | -0.176 | -0.133 |
| 6.047565858160115 | -0.217 | -0.175 | -0.132 |
| 6.050707450813704 | -0.215 | -0.174 | -0.132 |
| 6.053849043467294 | -0.212 | -0.173 | -0.132 |
| 6.056990636120884 | -0.21 | -0.172 | -0.132 |
| 6.060132228774473 | -0.207 | -0.17 | -0.131 |
| 6.063273821428063 | -0.205 | -0.169 | -0.131 |
| 6.066415414081653 | -0.202 | -0.168 | -0.13 |
| 6.069557006735242 | -0.2 | -0.167 | -0.13 |
| 6.072698599388831 | -0.197 | -0.165 | -0.13 |
| 6.07584019204242 | -0.195 | -0.164 | -0.129 |
| 6.078981784696011 | -0.192 | -0.162 | -0.129 |
| 6.082123377349601 | -0.189 | -0.161 | -0.128 |
| 6.08526497000319 | -0.187 | -0.159 | -0.128 |
| 6.08840656265678 | -0.184 | -0.158 | -0.127 |
| 6.09154815531037 | -0.182 | -0.156 | -0.126 |
| 6.094689747963959 | -0.179 | -0.155 | -0.126 |
| 6.097831340617549 | -0.176 | -0.153 | -0.125 |
| 6.100972933271138 | -0.174 | -0.151 | -0.124 |
| 6.104114525924728 | -0.171 | -0.15 | -0.123 |
| 6.107256118578317 | -0.168 | -0.148 | -0.123 |
| 6.110397711231907 | -0.165 | -0.146 | -0.122 |
| 6.113539303885497 | -0.163 | -0.144 | -0.121 |
| 6.116680896539086 | -0.16 | -0.142 | -0.12 |
| 6.119822489192675 | -0.157 | -0.14 | -0.119 |
| 6.122964081846265 | -0.154 | -0.138 | -0.118 |
| 6.126105674499855 | -0.151 | -0.136 | -0.117 |
| 6.129247267153445 | -0.149 | -0.134 | -0.116 |
| 6.132388859807034 | -0.146 | -0.132 | -0.114 |
| 6.135530452460624 | -0.143 | -0.13 | -0.113 |
| 6.138672045114213 | -0.14 | -0.128 | -0.112 |
| 6.141813637767803 | -0.137 | -0.126 | -0.111 |
| 6.144955230421393 | -0.134 | -0.124 | -0.109 |
| 6.148096823074982 | -0.131 | -0.122 | -0.108 |
| 6.151238415728571 | -0.129 | -0.119 | -0.106 |
| 6.154380008382161 | -0.126 | -0.117 | -0.105 |
| 6.157521601035751 | -0.123 | -0.115 | -0.103 |
| 6.16066319368934 | -0.12 | -0.112 | -0.101 |
| 6.16380478634293 | -0.117 | -0.11 | -0.1 |
| 6.16694637899652 | -0.114 | -0.107 | -0.098 |
| 6.170087971650109 | -0.111 | -0.105 | -0.096 |
| 6.173229564303698 | -0.108 | -0.102 | -0.094 |
| 6.176371156957289 | -0.105 | -0.1 | -0.092 |
| 6.179512749610878 | -0.102 | -0.097 | -0.09 |
| 6.182654342264468 | -0.099 | -0.095 | -0.088 |
| 6.185795934918057 | -0.096 | -0.092 | -0.086 |
| 6.188937527571647 | -0.093 | -0.089 | -0.084 |
| 6.192079120225237 | -0.09 | -0.087 | -0.082 |
| 6.195220712878826 | -0.087 | -0.084 | -0.08 |
| 6.198362305532415 | -0.084 | -0.081 | -0.077 |
| 6.201503898186005 | -0.081 | -0.079 | -0.075 |
| 6.204645490839594 | -0.078 | -0.076 | -0.072 |
| 6.207787083493184 | -0.075 | -0.073 | -0.07 |
| 6.210928676146774 | -0.072 | -0.07 | -0.067 |
| 6.214070268800364 | -0.069 | -0.067 | -0.065 |
| 6.217211861453953 | -0.066 | -0.064 | -0.062 |
| 6.220353454107543 | -0.062 | -0.061 | -0.06 |
| 6.223495046761133 | -0.059 | -0.058 | -0.057 |
| 6.226636639414722 | -0.056 | -0.055 | -0.054 |
| 6.229778232068312 | -0.053 | -0.053 | -0.051 |
| 6.232919824721901 | -0.05 | -0.05 | -0.049 |
| 6.236061417375491 | -0.047 | -0.047 | -0.046 |
| 6.23920301002908 | -0.044 | -0.043 | -0.043 |
| 6.24234460268267 | -0.041 | -0.04 | -0.04 |
| 6.24548619533626 | -0.038 | -0.037 | -0.037 |
| 6.24862778798985 | -0.034 | -0.034 | -0.034 |
| 6.251769380643438 | -0.031 | -0.031 | -0.031 |
| 6.254910973297028 | -0.028 | -0.028 | -0.028 |
| 6.258052565950618 | -0.025 | -0.025 | -0.025 |
| 6.261194158604208 | -0.022 | -0.022 | -0.022 |
| 6.264335751257797 | -0.019 | -0.019 | -0.019 |
| 6.267477343911387 | -0.016 | -0.016 | -0.016 |
| 6.270618936564976 | -0.013 | -0.013 | -0.013 |
| 6.273760529218566 | -0.009 | -0.009 | -0.009 |
| 6.276902121872155 | -0.006 | -0.006 | -0.006 |
| 6.280043714525745 | -0.003 | -0.003 | -0.003 |
| 6.283185307179335 | 0 | 0 | 0 |